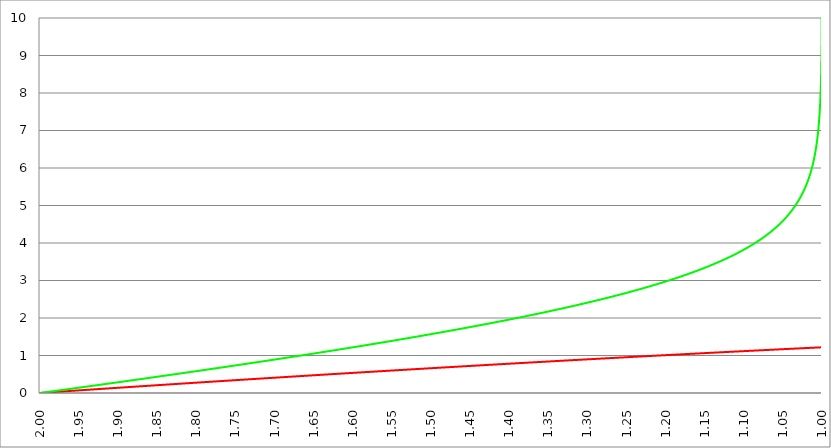
| Category | Series 1 | Series 0 | Series 2 |
|---|---|---|---|
| 2.0 | 0 | 0 |  |
| 1.9995 | 0.001 | 0.001 |  |
| 1.999 | 0.001 | 0.003 |  |
| 1.9985 | 0.002 | 0.004 |  |
| 1.998 | 0.003 | 0.006 |  |
| 1.9975 | 0.004 | 0.007 |  |
| 1.997 | 0.004 | 0.008 |  |
| 1.9965 | 0.005 | 0.01 |  |
| 1.996 | 0.006 | 0.011 |  |
| 1.9955 | 0.006 | 0.013 |  |
| 1.995000000000001 | 0.007 | 0.014 |  |
| 1.994500000000001 | 0.008 | 0.016 |  |
| 1.994000000000001 | 0.008 | 0.017 |  |
| 1.993500000000001 | 0.009 | 0.018 |  |
| 1.993000000000001 | 0.01 | 0.02 |  |
| 1.992500000000001 | 0.011 | 0.021 |  |
| 1.992000000000001 | 0.011 | 0.023 |  |
| 1.991500000000001 | 0.012 | 0.024 |  |
| 1.991000000000001 | 0.013 | 0.025 |  |
| 1.990500000000001 | 0.013 | 0.027 |  |
| 1.990000000000001 | 0.014 | 0.028 |  |
| 1.989500000000001 | 0.015 | 0.03 |  |
| 1.989000000000001 | 0.016 | 0.031 |  |
| 1.988500000000001 | 0.016 | 0.033 |  |
| 1.988000000000001 | 0.017 | 0.034 |  |
| 1.987500000000001 | 0.018 | 0.035 |  |
| 1.987000000000001 | 0.018 | 0.037 |  |
| 1.986500000000001 | 0.019 | 0.038 |  |
| 1.986000000000002 | 0.02 | 0.04 |  |
| 1.985500000000002 | 0.02 | 0.041 |  |
| 1.985000000000002 | 0.021 | 0.043 |  |
| 1.984500000000002 | 0.022 | 0.044 |  |
| 1.984000000000002 | 0.023 | 0.045 |  |
| 1.983500000000002 | 0.023 | 0.047 |  |
| 1.983000000000002 | 0.024 | 0.048 |  |
| 1.982500000000002 | 0.025 | 0.05 |  |
| 1.982000000000002 | 0.025 | 0.051 |  |
| 1.981500000000002 | 0.026 | 0.052 |  |
| 1.981000000000002 | 0.027 | 0.054 |  |
| 1.980500000000002 | 0.028 | 0.055 |  |
| 1.980000000000002 | 0.028 | 0.057 |  |
| 1.979500000000002 | 0.029 | 0.058 |  |
| 1.979000000000002 | 0.03 | 0.06 |  |
| 1.978500000000002 | 0.03 | 0.061 |  |
| 1.978000000000002 | 0.031 | 0.062 |  |
| 1.977500000000002 | 0.032 | 0.064 |  |
| 1.977000000000003 | 0.032 | 0.065 |  |
| 1.976500000000003 | 0.033 | 0.067 |  |
| 1.976000000000003 | 0.034 | 0.068 |  |
| 1.975500000000003 | 0.035 | 0.07 |  |
| 1.975000000000003 | 0.035 | 0.071 |  |
| 1.974500000000003 | 0.036 | 0.072 |  |
| 1.974000000000003 | 0.037 | 0.074 |  |
| 1.973500000000003 | 0.037 | 0.075 |  |
| 1.973000000000003 | 0.038 | 0.077 |  |
| 1.972500000000003 | 0.039 | 0.078 |  |
| 1.972000000000003 | 0.039 | 0.079 |  |
| 1.971500000000003 | 0.04 | 0.081 |  |
| 1.971000000000003 | 0.041 | 0.082 |  |
| 1.970500000000003 | 0.042 | 0.084 |  |
| 1.970000000000003 | 0.042 | 0.085 |  |
| 1.969500000000003 | 0.043 | 0.087 |  |
| 1.969000000000003 | 0.044 | 0.088 |  |
| 1.968500000000003 | 0.044 | 0.089 |  |
| 1.968000000000003 | 0.045 | 0.091 |  |
| 1.967500000000004 | 0.046 | 0.092 |  |
| 1.967000000000004 | 0.046 | 0.094 |  |
| 1.966500000000004 | 0.047 | 0.095 |  |
| 1.966000000000004 | 0.048 | 0.097 |  |
| 1.965500000000004 | 0.049 | 0.098 |  |
| 1.965000000000004 | 0.049 | 0.099 |  |
| 1.964500000000004 | 0.05 | 0.101 |  |
| 1.964000000000004 | 0.051 | 0.102 |  |
| 1.963500000000004 | 0.051 | 0.104 |  |
| 1.963000000000004 | 0.052 | 0.105 |  |
| 1.962500000000004 | 0.053 | 0.107 |  |
| 1.962000000000004 | 0.053 | 0.108 |  |
| 1.961500000000004 | 0.054 | 0.109 |  |
| 1.961000000000004 | 0.055 | 0.111 |  |
| 1.960500000000004 | 0.056 | 0.112 |  |
| 1.960000000000004 | 0.056 | 0.114 |  |
| 1.959500000000004 | 0.057 | 0.115 |  |
| 1.959000000000004 | 0.058 | 0.117 |  |
| 1.958500000000005 | 0.058 | 0.118 |  |
| 1.958000000000005 | 0.059 | 0.119 |  |
| 1.957500000000005 | 0.06 | 0.121 |  |
| 1.957000000000005 | 0.06 | 0.122 |  |
| 1.956500000000005 | 0.061 | 0.124 |  |
| 1.956000000000005 | 0.062 | 0.125 |  |
| 1.955500000000005 | 0.063 | 0.127 |  |
| 1.955000000000005 | 0.063 | 0.128 |  |
| 1.954500000000005 | 0.064 | 0.129 |  |
| 1.954000000000005 | 0.065 | 0.131 |  |
| 1.953500000000005 | 0.065 | 0.132 |  |
| 1.953000000000005 | 0.066 | 0.134 |  |
| 1.952500000000005 | 0.067 | 0.135 |  |
| 1.952000000000005 | 0.067 | 0.137 |  |
| 1.951500000000005 | 0.068 | 0.138 |  |
| 1.951000000000005 | 0.069 | 0.139 |  |
| 1.950500000000005 | 0.07 | 0.141 |  |
| 1.950000000000005 | 0.07 | 0.142 |  |
| 1.949500000000006 | 0.071 | 0.144 |  |
| 1.949000000000006 | 0.072 | 0.145 |  |
| 1.948500000000006 | 0.072 | 0.147 |  |
| 1.948000000000006 | 0.073 | 0.148 |  |
| 1.947500000000006 | 0.074 | 0.15 |  |
| 1.947000000000006 | 0.074 | 0.151 |  |
| 1.946500000000006 | 0.075 | 0.152 |  |
| 1.946000000000006 | 0.076 | 0.154 |  |
| 1.945500000000006 | 0.077 | 0.155 |  |
| 1.945000000000006 | 0.077 | 0.157 |  |
| 1.944500000000006 | 0.078 | 0.158 |  |
| 1.944000000000006 | 0.079 | 0.16 |  |
| 1.943500000000006 | 0.079 | 0.161 |  |
| 1.943000000000006 | 0.08 | 0.162 |  |
| 1.942500000000006 | 0.081 | 0.164 |  |
| 1.942000000000006 | 0.081 | 0.165 |  |
| 1.941500000000006 | 0.082 | 0.167 |  |
| 1.941000000000006 | 0.083 | 0.168 |  |
| 1.940500000000007 | 0.084 | 0.17 |  |
| 1.940000000000007 | 0.084 | 0.171 |  |
| 1.939500000000007 | 0.085 | 0.172 |  |
| 1.939000000000007 | 0.086 | 0.174 |  |
| 1.938500000000007 | 0.086 | 0.175 |  |
| 1.938000000000007 | 0.087 | 0.177 |  |
| 1.937500000000007 | 0.088 | 0.178 |  |
| 1.937000000000007 | 0.088 | 0.18 |  |
| 1.936500000000007 | 0.089 | 0.181 |  |
| 1.936000000000007 | 0.09 | 0.183 |  |
| 1.935500000000007 | 0.09 | 0.184 |  |
| 1.935000000000007 | 0.091 | 0.185 |  |
| 1.934500000000007 | 0.092 | 0.187 |  |
| 1.934000000000007 | 0.093 | 0.188 |  |
| 1.933500000000007 | 0.093 | 0.19 |  |
| 1.933000000000007 | 0.094 | 0.191 |  |
| 1.932500000000007 | 0.095 | 0.193 |  |
| 1.932000000000007 | 0.095 | 0.194 |  |
| 1.931500000000008 | 0.096 | 0.196 |  |
| 1.931000000000008 | 0.097 | 0.197 |  |
| 1.930500000000008 | 0.097 | 0.198 |  |
| 1.930000000000008 | 0.098 | 0.2 |  |
| 1.929500000000008 | 0.099 | 0.201 |  |
| 1.929000000000008 | 0.1 | 0.203 |  |
| 1.928500000000008 | 0.1 | 0.204 |  |
| 1.928000000000008 | 0.101 | 0.206 |  |
| 1.927500000000008 | 0.102 | 0.207 |  |
| 1.927000000000008 | 0.102 | 0.208 |  |
| 1.926500000000008 | 0.103 | 0.21 |  |
| 1.926000000000008 | 0.104 | 0.211 |  |
| 1.925500000000008 | 0.104 | 0.213 |  |
| 1.925000000000008 | 0.105 | 0.214 |  |
| 1.924500000000008 | 0.106 | 0.216 |  |
| 1.924000000000008 | 0.106 | 0.217 |  |
| 1.923500000000008 | 0.107 | 0.219 |  |
| 1.923000000000008 | 0.108 | 0.22 |  |
| 1.922500000000009 | 0.109 | 0.221 |  |
| 1.922000000000009 | 0.109 | 0.223 |  |
| 1.921500000000009 | 0.11 | 0.224 |  |
| 1.921000000000009 | 0.111 | 0.226 |  |
| 1.920500000000009 | 0.111 | 0.227 |  |
| 1.920000000000009 | 0.112 | 0.229 |  |
| 1.919500000000009 | 0.113 | 0.23 |  |
| 1.919000000000009 | 0.113 | 0.232 |  |
| 1.918500000000009 | 0.114 | 0.233 |  |
| 1.91800000000001 | 0.115 | 0.234 |  |
| 1.917500000000009 | 0.115 | 0.236 |  |
| 1.917000000000009 | 0.116 | 0.237 |  |
| 1.916500000000009 | 0.117 | 0.239 |  |
| 1.916000000000009 | 0.118 | 0.24 |  |
| 1.915500000000009 | 0.118 | 0.242 |  |
| 1.915000000000009 | 0.119 | 0.243 |  |
| 1.914500000000009 | 0.12 | 0.245 |  |
| 1.914000000000009 | 0.12 | 0.246 |  |
| 1.91350000000001 | 0.121 | 0.248 |  |
| 1.91300000000001 | 0.122 | 0.249 |  |
| 1.91250000000001 | 0.122 | 0.25 |  |
| 1.91200000000001 | 0.123 | 0.252 |  |
| 1.91150000000001 | 0.124 | 0.253 |  |
| 1.91100000000001 | 0.124 | 0.255 |  |
| 1.91050000000001 | 0.125 | 0.256 |  |
| 1.91000000000001 | 0.126 | 0.258 |  |
| 1.90950000000001 | 0.127 | 0.259 |  |
| 1.90900000000001 | 0.127 | 0.261 |  |
| 1.90850000000001 | 0.128 | 0.262 |  |
| 1.90800000000001 | 0.129 | 0.263 |  |
| 1.90750000000001 | 0.129 | 0.265 |  |
| 1.90700000000001 | 0.13 | 0.266 |  |
| 1.90650000000001 | 0.131 | 0.268 |  |
| 1.90600000000001 | 0.131 | 0.269 |  |
| 1.90550000000001 | 0.132 | 0.271 |  |
| 1.90500000000001 | 0.133 | 0.272 |  |
| 1.90450000000001 | 0.133 | 0.274 |  |
| 1.904000000000011 | 0.134 | 0.275 |  |
| 1.903500000000011 | 0.135 | 0.277 |  |
| 1.903000000000011 | 0.136 | 0.278 |  |
| 1.902500000000011 | 0.136 | 0.279 |  |
| 1.902000000000011 | 0.137 | 0.281 |  |
| 1.901500000000011 | 0.138 | 0.282 |  |
| 1.901000000000011 | 0.138 | 0.284 |  |
| 1.900500000000011 | 0.139 | 0.285 |  |
| 1.900000000000011 | 0.14 | 0.287 |  |
| 1.899500000000011 | 0.14 | 0.288 |  |
| 1.899000000000011 | 0.141 | 0.29 |  |
| 1.898500000000011 | 0.142 | 0.291 |  |
| 1.898000000000011 | 0.142 | 0.293 |  |
| 1.897500000000011 | 0.143 | 0.294 |  |
| 1.897000000000011 | 0.144 | 0.295 |  |
| 1.896500000000011 | 0.144 | 0.297 |  |
| 1.896000000000011 | 0.145 | 0.298 |  |
| 1.895500000000011 | 0.146 | 0.3 |  |
| 1.895000000000011 | 0.147 | 0.301 |  |
| 1.894500000000012 | 0.147 | 0.303 |  |
| 1.894000000000012 | 0.148 | 0.304 |  |
| 1.893500000000012 | 0.149 | 0.306 |  |
| 1.893000000000012 | 0.149 | 0.307 |  |
| 1.892500000000012 | 0.15 | 0.309 |  |
| 1.892000000000012 | 0.151 | 0.31 |  |
| 1.891500000000012 | 0.151 | 0.311 |  |
| 1.891000000000012 | 0.152 | 0.313 |  |
| 1.890500000000012 | 0.153 | 0.314 |  |
| 1.890000000000012 | 0.153 | 0.316 |  |
| 1.889500000000012 | 0.154 | 0.317 |  |
| 1.889000000000012 | 0.155 | 0.319 |  |
| 1.888500000000012 | 0.155 | 0.32 |  |
| 1.888000000000012 | 0.156 | 0.322 |  |
| 1.887500000000012 | 0.157 | 0.323 |  |
| 1.887000000000012 | 0.158 | 0.325 |  |
| 1.886500000000012 | 0.158 | 0.326 |  |
| 1.886000000000012 | 0.159 | 0.328 |  |
| 1.885500000000013 | 0.16 | 0.329 |  |
| 1.885000000000013 | 0.16 | 0.33 |  |
| 1.884500000000013 | 0.161 | 0.332 |  |
| 1.884000000000013 | 0.162 | 0.333 |  |
| 1.883500000000013 | 0.162 | 0.335 |  |
| 1.883000000000013 | 0.163 | 0.336 |  |
| 1.882500000000013 | 0.164 | 0.338 |  |
| 1.882000000000013 | 0.164 | 0.339 |  |
| 1.881500000000013 | 0.165 | 0.341 |  |
| 1.881000000000013 | 0.166 | 0.342 |  |
| 1.880500000000013 | 0.166 | 0.344 |  |
| 1.880000000000013 | 0.167 | 0.345 |  |
| 1.879500000000013 | 0.168 | 0.347 |  |
| 1.879000000000013 | 0.169 | 0.348 |  |
| 1.878500000000013 | 0.169 | 0.35 |  |
| 1.878000000000013 | 0.17 | 0.351 |  |
| 1.877500000000013 | 0.171 | 0.352 |  |
| 1.877000000000013 | 0.171 | 0.354 |  |
| 1.876500000000014 | 0.172 | 0.355 |  |
| 1.876000000000014 | 0.173 | 0.357 |  |
| 1.875500000000014 | 0.173 | 0.358 |  |
| 1.875000000000014 | 0.174 | 0.36 |  |
| 1.874500000000014 | 0.175 | 0.361 |  |
| 1.874000000000014 | 0.175 | 0.363 |  |
| 1.873500000000014 | 0.176 | 0.364 |  |
| 1.873000000000014 | 0.177 | 0.366 |  |
| 1.872500000000014 | 0.177 | 0.367 |  |
| 1.872000000000014 | 0.178 | 0.369 |  |
| 1.871500000000014 | 0.179 | 0.37 |  |
| 1.871000000000014 | 0.179 | 0.372 |  |
| 1.870500000000014 | 0.18 | 0.373 |  |
| 1.870000000000014 | 0.181 | 0.374 |  |
| 1.869500000000014 | 0.182 | 0.376 |  |
| 1.869000000000014 | 0.182 | 0.377 |  |
| 1.868500000000014 | 0.183 | 0.379 |  |
| 1.868000000000014 | 0.184 | 0.38 |  |
| 1.867500000000015 | 0.184 | 0.382 |  |
| 1.867000000000015 | 0.185 | 0.383 |  |
| 1.866500000000015 | 0.186 | 0.385 |  |
| 1.866000000000015 | 0.186 | 0.386 |  |
| 1.865500000000015 | 0.187 | 0.388 |  |
| 1.865000000000015 | 0.188 | 0.389 |  |
| 1.864500000000015 | 0.188 | 0.391 |  |
| 1.864000000000015 | 0.189 | 0.392 |  |
| 1.863500000000015 | 0.19 | 0.394 |  |
| 1.863000000000015 | 0.19 | 0.395 |  |
| 1.862500000000015 | 0.191 | 0.397 |  |
| 1.862000000000015 | 0.192 | 0.398 |  |
| 1.861500000000015 | 0.192 | 0.399 |  |
| 1.861000000000015 | 0.193 | 0.401 |  |
| 1.860500000000015 | 0.194 | 0.402 |  |
| 1.860000000000015 | 0.194 | 0.404 |  |
| 1.859500000000015 | 0.195 | 0.405 |  |
| 1.859000000000015 | 0.196 | 0.407 |  |
| 1.858500000000016 | 0.197 | 0.408 |  |
| 1.858000000000016 | 0.197 | 0.41 |  |
| 1.857500000000016 | 0.198 | 0.411 |  |
| 1.857000000000016 | 0.199 | 0.413 |  |
| 1.856500000000016 | 0.199 | 0.414 |  |
| 1.856000000000016 | 0.2 | 0.416 |  |
| 1.855500000000016 | 0.201 | 0.417 |  |
| 1.855000000000016 | 0.201 | 0.419 |  |
| 1.854500000000016 | 0.202 | 0.42 |  |
| 1.854000000000016 | 0.203 | 0.422 |  |
| 1.853500000000016 | 0.203 | 0.423 |  |
| 1.853000000000016 | 0.204 | 0.425 |  |
| 1.852500000000016 | 0.205 | 0.426 |  |
| 1.852000000000016 | 0.205 | 0.428 |  |
| 1.851500000000016 | 0.206 | 0.429 |  |
| 1.851000000000016 | 0.207 | 0.43 |  |
| 1.850500000000016 | 0.207 | 0.432 |  |
| 1.850000000000016 | 0.208 | 0.433 |  |
| 1.849500000000017 | 0.209 | 0.435 |  |
| 1.849000000000017 | 0.209 | 0.436 |  |
| 1.848500000000017 | 0.21 | 0.438 |  |
| 1.848000000000017 | 0.211 | 0.439 |  |
| 1.847500000000017 | 0.212 | 0.441 |  |
| 1.847000000000017 | 0.212 | 0.442 |  |
| 1.846500000000017 | 0.213 | 0.444 |  |
| 1.846000000000017 | 0.214 | 0.445 |  |
| 1.845500000000017 | 0.214 | 0.447 |  |
| 1.845000000000017 | 0.215 | 0.448 |  |
| 1.844500000000017 | 0.216 | 0.45 |  |
| 1.844000000000017 | 0.216 | 0.451 |  |
| 1.843500000000017 | 0.217 | 0.453 |  |
| 1.843000000000017 | 0.218 | 0.454 |  |
| 1.842500000000017 | 0.218 | 0.456 |  |
| 1.842000000000017 | 0.219 | 0.457 |  |
| 1.841500000000017 | 0.22 | 0.459 |  |
| 1.841000000000017 | 0.22 | 0.46 |  |
| 1.840500000000018 | 0.221 | 0.462 |  |
| 1.840000000000018 | 0.222 | 0.463 |  |
| 1.839500000000018 | 0.222 | 0.465 |  |
| 1.839000000000018 | 0.223 | 0.466 |  |
| 1.838500000000018 | 0.224 | 0.468 |  |
| 1.838000000000018 | 0.224 | 0.469 |  |
| 1.837500000000018 | 0.225 | 0.471 |  |
| 1.837000000000018 | 0.226 | 0.472 |  |
| 1.836500000000018 | 0.226 | 0.474 |  |
| 1.836000000000018 | 0.227 | 0.475 |  |
| 1.835500000000018 | 0.228 | 0.476 |  |
| 1.835000000000018 | 0.228 | 0.478 |  |
| 1.834500000000018 | 0.229 | 0.479 |  |
| 1.834000000000018 | 0.23 | 0.481 |  |
| 1.833500000000018 | 0.23 | 0.482 |  |
| 1.833000000000018 | 0.231 | 0.484 |  |
| 1.832500000000018 | 0.232 | 0.485 |  |
| 1.832000000000018 | 0.233 | 0.487 |  |
| 1.831500000000019 | 0.233 | 0.488 |  |
| 1.831000000000019 | 0.234 | 0.49 |  |
| 1.830500000000019 | 0.235 | 0.491 |  |
| 1.830000000000019 | 0.235 | 0.493 |  |
| 1.829500000000019 | 0.236 | 0.494 |  |
| 1.829000000000019 | 0.237 | 0.496 |  |
| 1.828500000000019 | 0.237 | 0.497 |  |
| 1.828000000000019 | 0.238 | 0.499 |  |
| 1.827500000000019 | 0.239 | 0.5 |  |
| 1.82700000000002 | 0.239 | 0.502 |  |
| 1.82650000000002 | 0.24 | 0.503 |  |
| 1.82600000000002 | 0.241 | 0.505 |  |
| 1.825500000000019 | 0.241 | 0.506 |  |
| 1.825000000000019 | 0.242 | 0.508 |  |
| 1.824500000000019 | 0.243 | 0.509 |  |
| 1.824000000000019 | 0.243 | 0.511 |  |
| 1.823500000000019 | 0.244 | 0.512 |  |
| 1.823000000000019 | 0.245 | 0.514 |  |
| 1.822500000000019 | 0.245 | 0.515 |  |
| 1.82200000000002 | 0.246 | 0.517 |  |
| 1.82150000000002 | 0.247 | 0.518 |  |
| 1.82100000000002 | 0.247 | 0.52 |  |
| 1.82050000000002 | 0.248 | 0.521 |  |
| 1.82000000000002 | 0.249 | 0.523 |  |
| 1.81950000000002 | 0.249 | 0.524 |  |
| 1.81900000000002 | 0.25 | 0.526 |  |
| 1.81850000000002 | 0.251 | 0.527 |  |
| 1.81800000000002 | 0.251 | 0.529 |  |
| 1.81750000000002 | 0.252 | 0.53 |  |
| 1.81700000000002 | 0.253 | 0.532 |  |
| 1.81650000000002 | 0.253 | 0.533 |  |
| 1.81600000000002 | 0.254 | 0.535 |  |
| 1.81550000000002 | 0.255 | 0.536 |  |
| 1.81500000000002 | 0.255 | 0.538 |  |
| 1.81450000000002 | 0.256 | 0.539 |  |
| 1.81400000000002 | 0.257 | 0.541 |  |
| 1.81350000000002 | 0.258 | 0.542 |  |
| 1.813000000000021 | 0.258 | 0.544 |  |
| 1.812500000000021 | 0.259 | 0.545 |  |
| 1.812000000000021 | 0.26 | 0.547 |  |
| 1.811500000000021 | 0.26 | 0.548 |  |
| 1.811000000000021 | 0.261 | 0.55 |  |
| 1.810500000000021 | 0.262 | 0.551 |  |
| 1.810000000000021 | 0.262 | 0.553 |  |
| 1.809500000000021 | 0.263 | 0.554 |  |
| 1.809000000000021 | 0.264 | 0.556 |  |
| 1.808500000000021 | 0.264 | 0.557 |  |
| 1.808000000000021 | 0.265 | 0.559 |  |
| 1.807500000000021 | 0.266 | 0.56 |  |
| 1.807000000000021 | 0.266 | 0.562 |  |
| 1.806500000000021 | 0.267 | 0.563 |  |
| 1.806000000000021 | 0.268 | 0.565 |  |
| 1.805500000000021 | 0.268 | 0.566 |  |
| 1.805000000000021 | 0.269 | 0.568 |  |
| 1.804500000000021 | 0.27 | 0.569 |  |
| 1.804000000000022 | 0.27 | 0.571 |  |
| 1.803500000000022 | 0.271 | 0.572 |  |
| 1.803000000000022 | 0.272 | 0.574 |  |
| 1.802500000000022 | 0.272 | 0.575 |  |
| 1.802000000000022 | 0.273 | 0.577 |  |
| 1.801500000000022 | 0.274 | 0.578 |  |
| 1.801000000000022 | 0.274 | 0.58 |  |
| 1.800500000000022 | 0.275 | 0.581 |  |
| 1.800000000000022 | 0.276 | 0.583 |  |
| 1.799500000000022 | 0.276 | 0.584 |  |
| 1.799000000000022 | 0.277 | 0.586 |  |
| 1.798500000000022 | 0.278 | 0.587 |  |
| 1.798000000000022 | 0.278 | 0.589 |  |
| 1.797500000000022 | 0.279 | 0.59 |  |
| 1.797000000000022 | 0.28 | 0.592 |  |
| 1.796500000000022 | 0.28 | 0.593 |  |
| 1.796000000000022 | 0.281 | 0.595 |  |
| 1.795500000000022 | 0.282 | 0.596 |  |
| 1.795000000000022 | 0.282 | 0.598 |  |
| 1.794500000000023 | 0.283 | 0.6 |  |
| 1.794000000000023 | 0.284 | 0.601 |  |
| 1.793500000000023 | 0.284 | 0.603 |  |
| 1.793000000000023 | 0.285 | 0.604 |  |
| 1.792500000000023 | 0.286 | 0.606 |  |
| 1.792000000000023 | 0.286 | 0.607 |  |
| 1.791500000000023 | 0.287 | 0.609 |  |
| 1.791000000000023 | 0.288 | 0.61 |  |
| 1.790500000000023 | 0.288 | 0.612 |  |
| 1.790000000000023 | 0.289 | 0.613 |  |
| 1.789500000000023 | 0.29 | 0.615 |  |
| 1.789000000000023 | 0.29 | 0.616 |  |
| 1.788500000000023 | 0.291 | 0.618 |  |
| 1.788000000000023 | 0.292 | 0.619 |  |
| 1.787500000000023 | 0.292 | 0.621 |  |
| 1.787000000000023 | 0.293 | 0.622 |  |
| 1.786500000000023 | 0.294 | 0.624 |  |
| 1.786000000000023 | 0.294 | 0.625 |  |
| 1.785500000000024 | 0.295 | 0.627 |  |
| 1.785000000000024 | 0.296 | 0.628 |  |
| 1.784500000000024 | 0.296 | 0.63 |  |
| 1.784000000000024 | 0.297 | 0.631 |  |
| 1.783500000000024 | 0.298 | 0.633 |  |
| 1.783000000000024 | 0.298 | 0.634 |  |
| 1.782500000000024 | 0.299 | 0.636 |  |
| 1.782000000000024 | 0.3 | 0.637 |  |
| 1.781500000000024 | 0.3 | 0.639 |  |
| 1.781000000000024 | 0.301 | 0.64 |  |
| 1.780500000000024 | 0.302 | 0.642 |  |
| 1.780000000000024 | 0.302 | 0.644 |  |
| 1.779500000000024 | 0.303 | 0.645 |  |
| 1.779000000000024 | 0.304 | 0.647 |  |
| 1.778500000000024 | 0.304 | 0.648 |  |
| 1.778000000000024 | 0.305 | 0.65 |  |
| 1.777500000000024 | 0.306 | 0.651 |  |
| 1.777000000000024 | 0.306 | 0.653 |  |
| 1.776500000000025 | 0.307 | 0.654 |  |
| 1.776000000000025 | 0.308 | 0.656 |  |
| 1.775500000000025 | 0.308 | 0.657 |  |
| 1.775000000000025 | 0.309 | 0.659 |  |
| 1.774500000000025 | 0.31 | 0.66 |  |
| 1.774000000000025 | 0.31 | 0.662 |  |
| 1.773500000000025 | 0.311 | 0.663 |  |
| 1.773000000000025 | 0.312 | 0.665 |  |
| 1.772500000000025 | 0.312 | 0.666 |  |
| 1.772000000000025 | 0.313 | 0.668 |  |
| 1.771500000000025 | 0.314 | 0.669 |  |
| 1.771000000000025 | 0.314 | 0.671 |  |
| 1.770500000000025 | 0.315 | 0.673 |  |
| 1.770000000000025 | 0.316 | 0.674 |  |
| 1.769500000000025 | 0.316 | 0.676 |  |
| 1.769000000000025 | 0.317 | 0.677 |  |
| 1.768500000000025 | 0.318 | 0.679 |  |
| 1.768000000000025 | 0.318 | 0.68 |  |
| 1.767500000000026 | 0.319 | 0.682 |  |
| 1.767000000000026 | 0.32 | 0.683 |  |
| 1.766500000000026 | 0.32 | 0.685 |  |
| 1.766000000000026 | 0.321 | 0.686 |  |
| 1.765500000000026 | 0.322 | 0.688 |  |
| 1.765000000000026 | 0.322 | 0.689 |  |
| 1.764500000000026 | 0.323 | 0.691 |  |
| 1.764000000000026 | 0.324 | 0.692 |  |
| 1.763500000000026 | 0.324 | 0.694 |  |
| 1.763000000000026 | 0.325 | 0.695 |  |
| 1.762500000000026 | 0.326 | 0.697 |  |
| 1.762000000000026 | 0.326 | 0.699 |  |
| 1.761500000000026 | 0.327 | 0.7 |  |
| 1.761000000000026 | 0.328 | 0.702 |  |
| 1.760500000000026 | 0.328 | 0.703 |  |
| 1.760000000000026 | 0.329 | 0.705 |  |
| 1.759500000000026 | 0.33 | 0.706 |  |
| 1.759000000000026 | 0.33 | 0.708 |  |
| 1.758500000000027 | 0.331 | 0.709 |  |
| 1.758000000000027 | 0.332 | 0.711 |  |
| 1.757500000000027 | 0.332 | 0.712 |  |
| 1.757000000000027 | 0.333 | 0.714 |  |
| 1.756500000000027 | 0.334 | 0.715 |  |
| 1.756000000000027 | 0.334 | 0.717 |  |
| 1.755500000000027 | 0.335 | 0.719 |  |
| 1.755000000000027 | 0.336 | 0.72 |  |
| 1.754500000000027 | 0.336 | 0.722 |  |
| 1.754000000000027 | 0.337 | 0.723 |  |
| 1.753500000000027 | 0.338 | 0.725 |  |
| 1.753000000000027 | 0.338 | 0.726 |  |
| 1.752500000000027 | 0.339 | 0.728 |  |
| 1.752000000000027 | 0.34 | 0.729 |  |
| 1.751500000000027 | 0.34 | 0.731 |  |
| 1.751000000000027 | 0.341 | 0.732 |  |
| 1.750500000000027 | 0.342 | 0.734 |  |
| 1.750000000000027 | 0.342 | 0.735 |  |
| 1.749500000000028 | 0.343 | 0.737 |  |
| 1.749000000000028 | 0.344 | 0.739 |  |
| 1.748500000000028 | 0.344 | 0.74 |  |
| 1.748000000000028 | 0.345 | 0.742 |  |
| 1.747500000000028 | 0.346 | 0.743 |  |
| 1.747000000000028 | 0.346 | 0.745 |  |
| 1.746500000000028 | 0.347 | 0.746 |  |
| 1.746000000000028 | 0.348 | 0.748 |  |
| 1.745500000000028 | 0.348 | 0.749 |  |
| 1.745000000000028 | 0.349 | 0.751 |  |
| 1.744500000000028 | 0.35 | 0.752 |  |
| 1.744000000000028 | 0.35 | 0.754 |  |
| 1.743500000000028 | 0.351 | 0.756 |  |
| 1.743000000000028 | 0.352 | 0.757 |  |
| 1.742500000000028 | 0.352 | 0.759 |  |
| 1.742000000000028 | 0.353 | 0.76 |  |
| 1.741500000000028 | 0.353 | 0.762 |  |
| 1.741000000000028 | 0.354 | 0.763 |  |
| 1.740500000000029 | 0.355 | 0.765 |  |
| 1.740000000000029 | 0.355 | 0.766 |  |
| 1.739500000000029 | 0.356 | 0.768 |  |
| 1.739000000000029 | 0.357 | 0.77 |  |
| 1.738500000000029 | 0.357 | 0.771 |  |
| 1.738000000000029 | 0.358 | 0.773 |  |
| 1.737500000000029 | 0.359 | 0.774 |  |
| 1.737000000000029 | 0.359 | 0.776 |  |
| 1.736500000000029 | 0.36 | 0.777 |  |
| 1.73600000000003 | 0.361 | 0.779 |  |
| 1.73550000000003 | 0.361 | 0.78 |  |
| 1.73500000000003 | 0.362 | 0.782 |  |
| 1.73450000000003 | 0.363 | 0.784 |  |
| 1.73400000000003 | 0.363 | 0.785 |  |
| 1.733500000000029 | 0.364 | 0.787 |  |
| 1.733000000000029 | 0.365 | 0.788 |  |
| 1.732500000000029 | 0.365 | 0.79 |  |
| 1.732000000000029 | 0.366 | 0.791 |  |
| 1.731500000000029 | 0.367 | 0.793 |  |
| 1.73100000000003 | 0.367 | 0.794 |  |
| 1.73050000000003 | 0.368 | 0.796 |  |
| 1.73000000000003 | 0.369 | 0.798 |  |
| 1.72950000000003 | 0.369 | 0.799 |  |
| 1.72900000000003 | 0.37 | 0.801 |  |
| 1.72850000000003 | 0.371 | 0.802 |  |
| 1.72800000000003 | 0.371 | 0.804 |  |
| 1.72750000000003 | 0.372 | 0.805 |  |
| 1.72700000000003 | 0.373 | 0.807 |  |
| 1.72650000000003 | 0.373 | 0.808 |  |
| 1.72600000000003 | 0.374 | 0.81 |  |
| 1.72550000000003 | 0.375 | 0.812 |  |
| 1.72500000000003 | 0.375 | 0.813 |  |
| 1.72450000000003 | 0.376 | 0.815 |  |
| 1.72400000000003 | 0.377 | 0.816 |  |
| 1.72350000000003 | 0.377 | 0.818 |  |
| 1.72300000000003 | 0.378 | 0.819 |  |
| 1.72250000000003 | 0.378 | 0.821 |  |
| 1.722000000000031 | 0.379 | 0.823 |  |
| 1.721500000000031 | 0.38 | 0.824 |  |
| 1.721000000000031 | 0.38 | 0.826 |  |
| 1.720500000000031 | 0.381 | 0.827 |  |
| 1.720000000000031 | 0.382 | 0.829 |  |
| 1.719500000000031 | 0.382 | 0.83 |  |
| 1.719000000000031 | 0.383 | 0.832 |  |
| 1.718500000000031 | 0.384 | 0.833 |  |
| 1.718000000000031 | 0.384 | 0.835 |  |
| 1.717500000000031 | 0.385 | 0.837 |  |
| 1.717000000000031 | 0.386 | 0.838 |  |
| 1.716500000000031 | 0.386 | 0.84 |  |
| 1.716000000000031 | 0.387 | 0.841 |  |
| 1.715500000000031 | 0.388 | 0.843 |  |
| 1.715000000000031 | 0.388 | 0.844 |  |
| 1.714500000000031 | 0.389 | 0.846 |  |
| 1.714000000000031 | 0.39 | 0.848 |  |
| 1.713500000000031 | 0.39 | 0.849 |  |
| 1.713000000000032 | 0.391 | 0.851 |  |
| 1.712500000000032 | 0.392 | 0.852 |  |
| 1.712000000000032 | 0.392 | 0.854 |  |
| 1.711500000000032 | 0.393 | 0.855 |  |
| 1.711000000000032 | 0.394 | 0.857 |  |
| 1.710500000000032 | 0.394 | 0.859 |  |
| 1.710000000000032 | 0.395 | 0.86 |  |
| 1.709500000000032 | 0.396 | 0.862 |  |
| 1.709000000000032 | 0.396 | 0.863 |  |
| 1.708500000000032 | 0.397 | 0.865 |  |
| 1.708000000000032 | 0.397 | 0.866 |  |
| 1.707500000000032 | 0.398 | 0.868 |  |
| 1.707000000000032 | 0.399 | 0.87 |  |
| 1.706500000000032 | 0.399 | 0.871 |  |
| 1.706000000000032 | 0.4 | 0.873 |  |
| 1.705500000000032 | 0.401 | 0.874 |  |
| 1.705000000000032 | 0.401 | 0.876 |  |
| 1.704500000000032 | 0.402 | 0.878 |  |
| 1.704000000000033 | 0.403 | 0.879 |  |
| 1.703500000000033 | 0.403 | 0.881 |  |
| 1.703000000000033 | 0.404 | 0.882 |  |
| 1.702500000000033 | 0.405 | 0.884 |  |
| 1.702000000000033 | 0.405 | 0.885 |  |
| 1.701500000000033 | 0.406 | 0.887 |  |
| 1.701000000000033 | 0.407 | 0.889 |  |
| 1.700500000000033 | 0.407 | 0.89 |  |
| 1.700000000000033 | 0.408 | 0.892 |  |
| 1.699500000000033 | 0.409 | 0.893 |  |
| 1.699000000000033 | 0.409 | 0.895 |  |
| 1.698500000000033 | 0.41 | 0.897 |  |
| 1.698000000000033 | 0.411 | 0.898 |  |
| 1.697500000000033 | 0.411 | 0.9 |  |
| 1.697000000000033 | 0.412 | 0.901 |  |
| 1.696500000000033 | 0.412 | 0.903 |  |
| 1.696000000000033 | 0.413 | 0.904 |  |
| 1.695500000000033 | 0.414 | 0.906 |  |
| 1.695000000000033 | 0.414 | 0.908 |  |
| 1.694500000000034 | 0.415 | 0.909 |  |
| 1.694000000000034 | 0.416 | 0.911 |  |
| 1.693500000000034 | 0.416 | 0.912 |  |
| 1.693000000000034 | 0.417 | 0.914 |  |
| 1.692500000000034 | 0.418 | 0.916 |  |
| 1.692000000000034 | 0.418 | 0.917 |  |
| 1.691500000000034 | 0.419 | 0.919 |  |
| 1.691000000000034 | 0.42 | 0.92 |  |
| 1.690500000000034 | 0.42 | 0.922 |  |
| 1.690000000000034 | 0.421 | 0.924 |  |
| 1.689500000000034 | 0.422 | 0.925 |  |
| 1.689000000000034 | 0.422 | 0.927 |  |
| 1.688500000000034 | 0.423 | 0.928 |  |
| 1.688000000000034 | 0.424 | 0.93 |  |
| 1.687500000000034 | 0.424 | 0.931 |  |
| 1.687000000000034 | 0.425 | 0.933 |  |
| 1.686500000000034 | 0.425 | 0.935 |  |
| 1.686000000000034 | 0.426 | 0.936 |  |
| 1.685500000000035 | 0.427 | 0.938 |  |
| 1.685000000000035 | 0.427 | 0.939 |  |
| 1.684500000000035 | 0.428 | 0.941 |  |
| 1.684000000000035 | 0.429 | 0.943 |  |
| 1.683500000000035 | 0.429 | 0.944 |  |
| 1.683000000000035 | 0.43 | 0.946 |  |
| 1.682500000000035 | 0.431 | 0.947 |  |
| 1.682000000000035 | 0.431 | 0.949 |  |
| 1.681500000000035 | 0.432 | 0.951 |  |
| 1.681000000000035 | 0.433 | 0.952 |  |
| 1.680500000000035 | 0.433 | 0.954 |  |
| 1.680000000000035 | 0.434 | 0.955 |  |
| 1.679500000000035 | 0.435 | 0.957 |  |
| 1.679000000000035 | 0.435 | 0.959 |  |
| 1.678500000000035 | 0.436 | 0.96 |  |
| 1.678000000000035 | 0.437 | 0.962 |  |
| 1.677500000000035 | 0.437 | 0.963 |  |
| 1.677000000000035 | 0.438 | 0.965 |  |
| 1.676500000000036 | 0.438 | 0.967 |  |
| 1.676000000000036 | 0.439 | 0.968 |  |
| 1.675500000000036 | 0.44 | 0.97 |  |
| 1.675000000000036 | 0.44 | 0.971 |  |
| 1.674500000000036 | 0.441 | 0.973 |  |
| 1.674000000000036 | 0.442 | 0.975 |  |
| 1.673500000000036 | 0.442 | 0.976 |  |
| 1.673000000000036 | 0.443 | 0.978 |  |
| 1.672500000000036 | 0.444 | 0.98 |  |
| 1.672000000000036 | 0.444 | 0.981 |  |
| 1.671500000000036 | 0.445 | 0.983 |  |
| 1.671000000000036 | 0.446 | 0.984 |  |
| 1.670500000000036 | 0.446 | 0.986 |  |
| 1.670000000000036 | 0.447 | 0.988 |  |
| 1.669500000000036 | 0.448 | 0.989 |  |
| 1.669000000000036 | 0.448 | 0.991 |  |
| 1.668500000000036 | 0.449 | 0.992 |  |
| 1.668000000000036 | 0.449 | 0.994 |  |
| 1.667500000000037 | 0.45 | 0.996 |  |
| 1.667000000000037 | 0.451 | 0.997 |  |
| 1.666500000000037 | 0.451 | 0.999 |  |
| 1.666000000000037 | 0.452 | 1 |  |
| 1.665500000000037 | 0.453 | 1.002 |  |
| 1.665000000000037 | 0.453 | 1.004 |  |
| 1.664500000000037 | 0.454 | 1.005 |  |
| 1.664000000000037 | 0.455 | 1.007 |  |
| 1.663500000000037 | 0.455 | 1.009 |  |
| 1.663000000000037 | 0.456 | 1.01 |  |
| 1.662500000000037 | 0.457 | 1.012 |  |
| 1.662000000000037 | 0.457 | 1.013 |  |
| 1.661500000000037 | 0.458 | 1.015 |  |
| 1.661000000000037 | 0.458 | 1.017 |  |
| 1.660500000000037 | 0.459 | 1.018 |  |
| 1.660000000000037 | 0.46 | 1.02 |  |
| 1.659500000000037 | 0.46 | 1.021 |  |
| 1.659000000000037 | 0.461 | 1.023 |  |
| 1.658500000000038 | 0.462 | 1.025 |  |
| 1.658000000000038 | 0.462 | 1.026 |  |
| 1.657500000000038 | 0.463 | 1.028 |  |
| 1.657000000000038 | 0.464 | 1.03 |  |
| 1.656500000000038 | 0.464 | 1.031 |  |
| 1.656000000000038 | 0.465 | 1.033 |  |
| 1.655500000000038 | 0.466 | 1.034 |  |
| 1.655000000000038 | 0.466 | 1.036 |  |
| 1.654500000000038 | 0.467 | 1.038 |  |
| 1.654000000000038 | 0.468 | 1.039 |  |
| 1.653500000000038 | 0.468 | 1.041 |  |
| 1.653000000000038 | 0.469 | 1.043 |  |
| 1.652500000000038 | 0.469 | 1.044 |  |
| 1.652000000000038 | 0.47 | 1.046 |  |
| 1.651500000000038 | 0.471 | 1.047 |  |
| 1.651000000000038 | 0.471 | 1.049 |  |
| 1.650500000000038 | 0.472 | 1.051 |  |
| 1.650000000000038 | 0.473 | 1.052 |  |
| 1.649500000000039 | 0.473 | 1.054 |  |
| 1.649000000000039 | 0.474 | 1.056 |  |
| 1.648500000000039 | 0.475 | 1.057 |  |
| 1.648000000000039 | 0.475 | 1.059 |  |
| 1.647500000000039 | 0.476 | 1.061 |  |
| 1.647000000000039 | 0.476 | 1.062 |  |
| 1.646500000000039 | 0.477 | 1.064 |  |
| 1.646000000000039 | 0.478 | 1.065 |  |
| 1.645500000000039 | 0.478 | 1.067 |  |
| 1.64500000000004 | 0.479 | 1.069 |  |
| 1.64450000000004 | 0.48 | 1.07 |  |
| 1.64400000000004 | 0.48 | 1.072 |  |
| 1.643500000000039 | 0.481 | 1.074 |  |
| 1.643000000000039 | 0.482 | 1.075 |  |
| 1.642500000000039 | 0.482 | 1.077 |  |
| 1.642000000000039 | 0.483 | 1.079 |  |
| 1.641500000000039 | 0.484 | 1.08 |  |
| 1.641000000000039 | 0.484 | 1.082 |  |
| 1.640500000000039 | 0.485 | 1.083 |  |
| 1.64000000000004 | 0.485 | 1.085 |  |
| 1.63950000000004 | 0.486 | 1.087 |  |
| 1.63900000000004 | 0.487 | 1.088 |  |
| 1.63850000000004 | 0.487 | 1.09 |  |
| 1.63800000000004 | 0.488 | 1.092 |  |
| 1.63750000000004 | 0.489 | 1.093 |  |
| 1.63700000000004 | 0.489 | 1.095 |  |
| 1.63650000000004 | 0.49 | 1.097 |  |
| 1.63600000000004 | 0.491 | 1.098 |  |
| 1.63550000000004 | 0.491 | 1.1 |  |
| 1.63500000000004 | 0.492 | 1.102 |  |
| 1.63450000000004 | 0.493 | 1.103 |  |
| 1.63400000000004 | 0.493 | 1.105 |  |
| 1.63350000000004 | 0.494 | 1.106 |  |
| 1.63300000000004 | 0.494 | 1.108 |  |
| 1.63250000000004 | 0.495 | 1.11 |  |
| 1.63200000000004 | 0.496 | 1.111 |  |
| 1.63150000000004 | 0.496 | 1.113 |  |
| 1.631000000000041 | 0.497 | 1.115 |  |
| 1.630500000000041 | 0.498 | 1.116 |  |
| 1.630000000000041 | 0.498 | 1.118 |  |
| 1.629500000000041 | 0.499 | 1.12 |  |
| 1.629000000000041 | 0.5 | 1.121 |  |
| 1.628500000000041 | 0.5 | 1.123 |  |
| 1.628000000000041 | 0.501 | 1.125 |  |
| 1.627500000000041 | 0.501 | 1.126 |  |
| 1.627000000000041 | 0.502 | 1.128 |  |
| 1.626500000000041 | 0.503 | 1.13 |  |
| 1.626000000000041 | 0.503 | 1.131 |  |
| 1.625500000000041 | 0.504 | 1.133 |  |
| 1.625000000000041 | 0.505 | 1.135 |  |
| 1.624500000000041 | 0.505 | 1.136 |  |
| 1.624000000000041 | 0.506 | 1.138 |  |
| 1.623500000000041 | 0.507 | 1.14 |  |
| 1.623000000000041 | 0.507 | 1.141 |  |
| 1.622500000000041 | 0.508 | 1.143 |  |
| 1.622000000000042 | 0.508 | 1.145 |  |
| 1.621500000000042 | 0.509 | 1.146 |  |
| 1.621000000000042 | 0.51 | 1.148 |  |
| 1.620500000000042 | 0.51 | 1.149 |  |
| 1.620000000000042 | 0.511 | 1.151 |  |
| 1.619500000000042 | 0.512 | 1.153 |  |
| 1.619000000000042 | 0.512 | 1.154 |  |
| 1.618500000000042 | 0.513 | 1.156 |  |
| 1.618000000000042 | 0.514 | 1.158 |  |
| 1.617500000000042 | 0.514 | 1.159 |  |
| 1.617000000000042 | 0.515 | 1.161 |  |
| 1.616500000000042 | 0.515 | 1.163 |  |
| 1.616000000000042 | 0.516 | 1.164 |  |
| 1.615500000000042 | 0.517 | 1.166 |  |
| 1.615000000000042 | 0.517 | 1.168 |  |
| 1.614500000000042 | 0.518 | 1.169 |  |
| 1.614000000000042 | 0.519 | 1.171 |  |
| 1.613500000000042 | 0.519 | 1.173 |  |
| 1.613000000000043 | 0.52 | 1.174 |  |
| 1.612500000000043 | 0.521 | 1.176 |  |
| 1.612000000000043 | 0.521 | 1.178 |  |
| 1.611500000000043 | 0.522 | 1.18 |  |
| 1.611000000000043 | 0.522 | 1.181 |  |
| 1.610500000000043 | 0.523 | 1.183 |  |
| 1.610000000000043 | 0.524 | 1.185 |  |
| 1.609500000000043 | 0.524 | 1.186 |  |
| 1.609000000000043 | 0.525 | 1.188 |  |
| 1.608500000000043 | 0.526 | 1.19 |  |
| 1.608000000000043 | 0.526 | 1.191 |  |
| 1.607500000000043 | 0.527 | 1.193 |  |
| 1.607000000000043 | 0.528 | 1.195 |  |
| 1.606500000000043 | 0.528 | 1.196 |  |
| 1.606000000000043 | 0.529 | 1.198 |  |
| 1.605500000000043 | 0.529 | 1.2 |  |
| 1.605000000000043 | 0.53 | 1.201 |  |
| 1.604500000000043 | 0.531 | 1.203 |  |
| 1.604000000000044 | 0.531 | 1.205 |  |
| 1.603500000000044 | 0.532 | 1.206 |  |
| 1.603000000000044 | 0.533 | 1.208 |  |
| 1.602500000000044 | 0.533 | 1.21 |  |
| 1.602000000000044 | 0.534 | 1.211 |  |
| 1.601500000000044 | 0.534 | 1.213 |  |
| 1.601000000000044 | 0.535 | 1.215 |  |
| 1.600500000000044 | 0.536 | 1.216 |  |
| 1.600000000000044 | 0.536 | 1.218 |  |
| 1.599500000000044 | 0.537 | 1.22 |  |
| 1.599000000000044 | 0.538 | 1.222 |  |
| 1.598500000000044 | 0.538 | 1.223 |  |
| 1.598000000000044 | 0.539 | 1.225 |  |
| 1.597500000000044 | 0.54 | 1.227 |  |
| 1.597000000000044 | 0.54 | 1.228 |  |
| 1.596500000000044 | 0.541 | 1.23 |  |
| 1.596000000000044 | 0.541 | 1.232 |  |
| 1.595500000000045 | 0.542 | 1.233 |  |
| 1.595000000000045 | 0.543 | 1.235 |  |
| 1.594500000000045 | 0.543 | 1.237 |  |
| 1.594000000000045 | 0.544 | 1.238 |  |
| 1.593500000000045 | 0.545 | 1.24 |  |
| 1.593000000000045 | 0.545 | 1.242 |  |
| 1.592500000000045 | 0.546 | 1.244 |  |
| 1.592000000000045 | 0.546 | 1.245 |  |
| 1.591500000000045 | 0.547 | 1.247 |  |
| 1.591000000000045 | 0.548 | 1.249 |  |
| 1.590500000000045 | 0.548 | 1.25 |  |
| 1.590000000000045 | 0.549 | 1.252 |  |
| 1.589500000000045 | 0.55 | 1.254 |  |
| 1.589000000000045 | 0.55 | 1.255 |  |
| 1.588500000000045 | 0.551 | 1.257 |  |
| 1.588000000000045 | 0.552 | 1.259 |  |
| 1.587500000000045 | 0.552 | 1.26 |  |
| 1.587000000000045 | 0.553 | 1.262 |  |
| 1.586500000000046 | 0.553 | 1.264 |  |
| 1.586000000000046 | 0.554 | 1.266 |  |
| 1.585500000000046 | 0.555 | 1.267 |  |
| 1.585000000000046 | 0.555 | 1.269 |  |
| 1.584500000000046 | 0.556 | 1.271 |  |
| 1.584000000000046 | 0.557 | 1.272 |  |
| 1.583500000000046 | 0.557 | 1.274 |  |
| 1.583000000000046 | 0.558 | 1.276 |  |
| 1.582500000000046 | 0.558 | 1.278 |  |
| 1.582000000000046 | 0.559 | 1.279 |  |
| 1.581500000000046 | 0.56 | 1.281 |  |
| 1.581000000000046 | 0.56 | 1.283 |  |
| 1.580500000000046 | 0.561 | 1.284 |  |
| 1.580000000000046 | 0.562 | 1.286 |  |
| 1.579500000000046 | 0.562 | 1.288 |  |
| 1.579000000000046 | 0.563 | 1.29 |  |
| 1.578500000000046 | 0.563 | 1.291 |  |
| 1.578000000000046 | 0.564 | 1.293 |  |
| 1.577500000000047 | 0.565 | 1.295 |  |
| 1.577000000000047 | 0.565 | 1.296 |  |
| 1.576500000000047 | 0.566 | 1.298 |  |
| 1.576000000000047 | 0.567 | 1.3 |  |
| 1.575500000000047 | 0.567 | 1.302 |  |
| 1.575000000000047 | 0.568 | 1.303 |  |
| 1.574500000000047 | 0.569 | 1.305 |  |
| 1.574000000000047 | 0.569 | 1.307 |  |
| 1.573500000000047 | 0.57 | 1.308 |  |
| 1.573000000000047 | 0.57 | 1.31 |  |
| 1.572500000000047 | 0.571 | 1.312 |  |
| 1.572000000000047 | 0.572 | 1.314 |  |
| 1.571500000000047 | 0.572 | 1.315 |  |
| 1.571000000000047 | 0.573 | 1.317 |  |
| 1.570500000000047 | 0.574 | 1.319 |  |
| 1.570000000000047 | 0.574 | 1.32 |  |
| 1.569500000000047 | 0.575 | 1.322 |  |
| 1.569000000000047 | 0.575 | 1.324 |  |
| 1.568500000000048 | 0.576 | 1.326 |  |
| 1.568000000000048 | 0.577 | 1.327 |  |
| 1.567500000000048 | 0.577 | 1.329 |  |
| 1.567000000000048 | 0.578 | 1.331 |  |
| 1.566500000000048 | 0.579 | 1.333 |  |
| 1.566000000000048 | 0.579 | 1.334 |  |
| 1.565500000000048 | 0.58 | 1.336 |  |
| 1.565000000000048 | 0.58 | 1.338 |  |
| 1.564500000000048 | 0.581 | 1.34 |  |
| 1.564000000000048 | 0.582 | 1.341 |  |
| 1.563500000000048 | 0.582 | 1.343 |  |
| 1.563000000000048 | 0.583 | 1.345 |  |
| 1.562500000000048 | 0.584 | 1.346 |  |
| 1.562000000000048 | 0.584 | 1.348 |  |
| 1.561500000000048 | 0.585 | 1.35 |  |
| 1.561000000000048 | 0.585 | 1.352 |  |
| 1.560500000000048 | 0.586 | 1.353 |  |
| 1.560000000000048 | 0.587 | 1.355 |  |
| 1.559500000000049 | 0.587 | 1.357 |  |
| 1.559000000000049 | 0.588 | 1.359 |  |
| 1.558500000000049 | 0.589 | 1.36 |  |
| 1.558000000000049 | 0.589 | 1.362 |  |
| 1.557500000000049 | 0.59 | 1.364 |  |
| 1.557000000000049 | 0.59 | 1.366 |  |
| 1.556500000000049 | 0.591 | 1.367 |  |
| 1.556000000000049 | 0.592 | 1.369 |  |
| 1.555500000000049 | 0.592 | 1.371 |  |
| 1.555000000000049 | 0.593 | 1.373 |  |
| 1.55450000000005 | 0.594 | 1.374 |  |
| 1.55400000000005 | 0.594 | 1.376 |  |
| 1.553500000000049 | 0.595 | 1.378 |  |
| 1.553000000000049 | 0.595 | 1.38 |  |
| 1.552500000000049 | 0.596 | 1.381 |  |
| 1.552000000000049 | 0.597 | 1.383 |  |
| 1.551500000000049 | 0.597 | 1.385 |  |
| 1.551000000000049 | 0.598 | 1.387 |  |
| 1.550500000000049 | 0.599 | 1.388 |  |
| 1.55000000000005 | 0.599 | 1.39 |  |
| 1.54950000000005 | 0.6 | 1.392 |  |
| 1.54900000000005 | 0.6 | 1.394 |  |
| 1.54850000000005 | 0.601 | 1.395 |  |
| 1.54800000000005 | 0.602 | 1.397 |  |
| 1.54750000000005 | 0.602 | 1.399 |  |
| 1.54700000000005 | 0.603 | 1.401 |  |
| 1.54650000000005 | 0.603 | 1.402 |  |
| 1.54600000000005 | 0.604 | 1.404 |  |
| 1.54550000000005 | 0.605 | 1.406 |  |
| 1.54500000000005 | 0.605 | 1.408 |  |
| 1.54450000000005 | 0.606 | 1.409 |  |
| 1.54400000000005 | 0.607 | 1.411 |  |
| 1.54350000000005 | 0.607 | 1.413 |  |
| 1.54300000000005 | 0.608 | 1.415 |  |
| 1.54250000000005 | 0.608 | 1.416 |  |
| 1.54200000000005 | 0.609 | 1.418 |  |
| 1.54150000000005 | 0.61 | 1.42 |  |
| 1.541000000000051 | 0.61 | 1.422 |  |
| 1.540500000000051 | 0.611 | 1.424 |  |
| 1.540000000000051 | 0.612 | 1.425 |  |
| 1.539500000000051 | 0.612 | 1.427 |  |
| 1.539000000000051 | 0.613 | 1.429 |  |
| 1.538500000000051 | 0.613 | 1.431 |  |
| 1.538000000000051 | 0.614 | 1.432 |  |
| 1.537500000000051 | 0.615 | 1.434 |  |
| 1.537000000000051 | 0.615 | 1.436 |  |
| 1.536500000000051 | 0.616 | 1.438 |  |
| 1.536000000000051 | 0.617 | 1.439 |  |
| 1.535500000000051 | 0.617 | 1.441 |  |
| 1.535000000000051 | 0.618 | 1.443 |  |
| 1.534500000000051 | 0.618 | 1.445 |  |
| 1.534000000000051 | 0.619 | 1.447 |  |
| 1.533500000000051 | 0.62 | 1.448 |  |
| 1.533000000000051 | 0.62 | 1.45 |  |
| 1.532500000000051 | 0.621 | 1.452 |  |
| 1.532000000000052 | 0.621 | 1.454 |  |
| 1.531500000000052 | 0.622 | 1.456 |  |
| 1.531000000000052 | 0.623 | 1.457 |  |
| 1.530500000000052 | 0.623 | 1.459 |  |
| 1.530000000000052 | 0.624 | 1.461 |  |
| 1.529500000000052 | 0.625 | 1.463 |  |
| 1.529000000000052 | 0.625 | 1.464 |  |
| 1.528500000000052 | 0.626 | 1.466 |  |
| 1.528000000000052 | 0.626 | 1.468 |  |
| 1.527500000000052 | 0.627 | 1.47 |  |
| 1.527000000000052 | 0.628 | 1.472 |  |
| 1.526500000000052 | 0.628 | 1.473 |  |
| 1.526000000000052 | 0.629 | 1.475 |  |
| 1.525500000000052 | 0.63 | 1.477 |  |
| 1.525000000000052 | 0.63 | 1.479 |  |
| 1.524500000000052 | 0.631 | 1.481 |  |
| 1.524000000000052 | 0.631 | 1.482 |  |
| 1.523500000000052 | 0.632 | 1.484 |  |
| 1.523000000000053 | 0.633 | 1.486 |  |
| 1.522500000000053 | 0.633 | 1.488 |  |
| 1.522000000000053 | 0.634 | 1.49 |  |
| 1.521500000000053 | 0.634 | 1.491 |  |
| 1.521000000000053 | 0.635 | 1.493 |  |
| 1.520500000000053 | 0.636 | 1.495 |  |
| 1.520000000000053 | 0.636 | 1.497 |  |
| 1.519500000000053 | 0.637 | 1.499 |  |
| 1.519000000000053 | 0.638 | 1.5 |  |
| 1.518500000000053 | 0.638 | 1.502 |  |
| 1.518000000000053 | 0.639 | 1.504 |  |
| 1.517500000000053 | 0.639 | 1.506 |  |
| 1.517000000000053 | 0.64 | 1.508 |  |
| 1.516500000000053 | 0.641 | 1.509 |  |
| 1.516000000000053 | 0.641 | 1.511 |  |
| 1.515500000000053 | 0.642 | 1.513 |  |
| 1.515000000000053 | 0.642 | 1.515 |  |
| 1.514500000000053 | 0.643 | 1.517 |  |
| 1.514000000000054 | 0.644 | 1.518 |  |
| 1.513500000000054 | 0.644 | 1.52 |  |
| 1.513000000000054 | 0.645 | 1.522 |  |
| 1.512500000000054 | 0.646 | 1.524 |  |
| 1.512000000000054 | 0.646 | 1.526 |  |
| 1.511500000000054 | 0.647 | 1.527 |  |
| 1.511000000000054 | 0.647 | 1.529 |  |
| 1.510500000000054 | 0.648 | 1.531 |  |
| 1.510000000000054 | 0.649 | 1.533 |  |
| 1.509500000000054 | 0.649 | 1.535 |  |
| 1.509000000000054 | 0.65 | 1.537 |  |
| 1.508500000000054 | 0.65 | 1.538 |  |
| 1.508000000000054 | 0.651 | 1.54 |  |
| 1.507500000000054 | 0.652 | 1.542 |  |
| 1.507000000000054 | 0.652 | 1.544 |  |
| 1.506500000000054 | 0.653 | 1.546 |  |
| 1.506000000000054 | 0.654 | 1.548 |  |
| 1.505500000000054 | 0.654 | 1.549 |  |
| 1.505000000000055 | 0.655 | 1.551 |  |
| 1.504500000000055 | 0.655 | 1.553 |  |
| 1.504000000000055 | 0.656 | 1.555 |  |
| 1.503500000000055 | 0.657 | 1.557 |  |
| 1.503000000000055 | 0.657 | 1.558 |  |
| 1.502500000000055 | 0.658 | 1.56 |  |
| 1.502000000000055 | 0.658 | 1.562 |  |
| 1.501500000000055 | 0.659 | 1.564 |  |
| 1.501000000000055 | 0.66 | 1.566 |  |
| 1.500500000000055 | 0.66 | 1.568 |  |
| 1.500000000000055 | 0.661 | 1.569 |  |
| 1.499500000000055 | 0.661 | 1.571 |  |
| 1.499000000000055 | 0.662 | 1.573 |  |
| 1.498500000000055 | 0.663 | 1.575 |  |
| 1.498000000000055 | 0.663 | 1.577 |  |
| 1.497500000000055 | 0.664 | 1.579 |  |
| 1.497000000000055 | 0.665 | 1.581 |  |
| 1.496500000000055 | 0.665 | 1.582 |  |
| 1.496000000000055 | 0.666 | 1.584 |  |
| 1.495500000000056 | 0.666 | 1.586 |  |
| 1.495000000000056 | 0.667 | 1.588 |  |
| 1.494500000000056 | 0.668 | 1.59 |  |
| 1.494000000000056 | 0.668 | 1.592 |  |
| 1.493500000000056 | 0.669 | 1.593 |  |
| 1.493000000000056 | 0.669 | 1.595 |  |
| 1.492500000000056 | 0.67 | 1.597 |  |
| 1.492000000000056 | 0.671 | 1.599 |  |
| 1.491500000000056 | 0.671 | 1.601 |  |
| 1.491000000000056 | 0.672 | 1.603 |  |
| 1.490500000000056 | 0.672 | 1.605 |  |
| 1.490000000000056 | 0.673 | 1.606 |  |
| 1.489500000000056 | 0.674 | 1.608 |  |
| 1.489000000000056 | 0.674 | 1.61 |  |
| 1.488500000000056 | 0.675 | 1.612 |  |
| 1.488000000000056 | 0.676 | 1.614 |  |
| 1.487500000000056 | 0.676 | 1.616 |  |
| 1.487000000000056 | 0.677 | 1.618 |  |
| 1.486500000000057 | 0.677 | 1.619 |  |
| 1.486000000000057 | 0.678 | 1.621 |  |
| 1.485500000000057 | 0.679 | 1.623 |  |
| 1.485000000000057 | 0.679 | 1.625 |  |
| 1.484500000000057 | 0.68 | 1.627 |  |
| 1.484000000000057 | 0.68 | 1.629 |  |
| 1.483500000000057 | 0.681 | 1.631 |  |
| 1.483000000000057 | 0.682 | 1.633 |  |
| 1.482500000000057 | 0.682 | 1.634 |  |
| 1.482000000000057 | 0.683 | 1.636 |  |
| 1.481500000000057 | 0.683 | 1.638 |  |
| 1.481000000000057 | 0.684 | 1.64 |  |
| 1.480500000000057 | 0.685 | 1.642 |  |
| 1.480000000000057 | 0.685 | 1.644 |  |
| 1.479500000000057 | 0.686 | 1.646 |  |
| 1.479000000000057 | 0.687 | 1.647 |  |
| 1.478500000000057 | 0.687 | 1.649 |  |
| 1.478000000000057 | 0.688 | 1.651 |  |
| 1.477500000000058 | 0.688 | 1.653 |  |
| 1.477000000000058 | 0.689 | 1.655 |  |
| 1.476500000000058 | 0.69 | 1.657 |  |
| 1.476000000000058 | 0.69 | 1.659 |  |
| 1.475500000000058 | 0.691 | 1.661 |  |
| 1.475000000000058 | 0.691 | 1.663 |  |
| 1.474500000000058 | 0.692 | 1.664 |  |
| 1.474000000000058 | 0.693 | 1.666 |  |
| 1.473500000000058 | 0.693 | 1.668 |  |
| 1.473000000000058 | 0.694 | 1.67 |  |
| 1.472500000000058 | 0.694 | 1.672 |  |
| 1.472000000000058 | 0.695 | 1.674 |  |
| 1.471500000000058 | 0.696 | 1.676 |  |
| 1.471000000000058 | 0.696 | 1.678 |  |
| 1.470500000000058 | 0.697 | 1.68 |  |
| 1.470000000000058 | 0.697 | 1.681 |  |
| 1.469500000000058 | 0.698 | 1.683 |  |
| 1.469000000000058 | 0.699 | 1.685 |  |
| 1.468500000000059 | 0.699 | 1.687 |  |
| 1.468000000000059 | 0.7 | 1.689 |  |
| 1.467500000000059 | 0.7 | 1.691 |  |
| 1.467000000000059 | 0.701 | 1.693 |  |
| 1.466500000000059 | 0.702 | 1.695 |  |
| 1.466000000000059 | 0.702 | 1.697 |  |
| 1.465500000000059 | 0.703 | 1.699 |  |
| 1.465000000000059 | 0.703 | 1.7 |  |
| 1.464500000000059 | 0.704 | 1.702 |  |
| 1.464000000000059 | 0.705 | 1.704 |  |
| 1.463500000000059 | 0.705 | 1.706 |  |
| 1.463000000000059 | 0.706 | 1.708 |  |
| 1.462500000000059 | 0.707 | 1.71 |  |
| 1.462000000000059 | 0.707 | 1.712 |  |
| 1.461500000000059 | 0.708 | 1.714 |  |
| 1.461000000000059 | 0.708 | 1.716 |  |
| 1.460500000000059 | 0.709 | 1.718 |  |
| 1.460000000000059 | 0.71 | 1.72 |  |
| 1.459500000000059 | 0.71 | 1.722 |  |
| 1.45900000000006 | 0.711 | 1.723 |  |
| 1.45850000000006 | 0.711 | 1.725 |  |
| 1.45800000000006 | 0.712 | 1.727 |  |
| 1.45750000000006 | 0.713 | 1.729 |  |
| 1.45700000000006 | 0.713 | 1.731 |  |
| 1.45650000000006 | 0.714 | 1.733 |  |
| 1.45600000000006 | 0.714 | 1.735 |  |
| 1.45550000000006 | 0.715 | 1.737 |  |
| 1.45500000000006 | 0.716 | 1.739 |  |
| 1.45450000000006 | 0.716 | 1.741 |  |
| 1.45400000000006 | 0.717 | 1.743 |  |
| 1.45350000000006 | 0.717 | 1.745 |  |
| 1.45300000000006 | 0.718 | 1.747 |  |
| 1.45250000000006 | 0.719 | 1.748 |  |
| 1.45200000000006 | 0.719 | 1.75 |  |
| 1.45150000000006 | 0.72 | 1.752 |  |
| 1.45100000000006 | 0.72 | 1.754 |  |
| 1.45050000000006 | 0.721 | 1.756 |  |
| 1.450000000000061 | 0.722 | 1.758 |  |
| 1.449500000000061 | 0.722 | 1.76 |  |
| 1.449000000000061 | 0.723 | 1.762 |  |
| 1.448500000000061 | 0.723 | 1.764 |  |
| 1.448000000000061 | 0.724 | 1.766 |  |
| 1.447500000000061 | 0.725 | 1.768 |  |
| 1.447000000000061 | 0.725 | 1.77 |  |
| 1.446500000000061 | 0.726 | 1.772 |  |
| 1.446000000000061 | 0.726 | 1.774 |  |
| 1.445500000000061 | 0.727 | 1.776 |  |
| 1.445000000000061 | 0.728 | 1.778 |  |
| 1.444500000000061 | 0.728 | 1.78 |  |
| 1.444000000000061 | 0.729 | 1.782 |  |
| 1.443500000000061 | 0.729 | 1.783 |  |
| 1.443000000000061 | 0.73 | 1.785 |  |
| 1.442500000000061 | 0.731 | 1.787 |  |
| 1.442000000000061 | 0.731 | 1.789 |  |
| 1.441500000000061 | 0.732 | 1.791 |  |
| 1.441000000000062 | 0.732 | 1.793 |  |
| 1.440500000000062 | 0.733 | 1.795 |  |
| 1.440000000000062 | 0.734 | 1.797 |  |
| 1.439500000000062 | 0.734 | 1.799 |  |
| 1.439000000000062 | 0.735 | 1.801 |  |
| 1.438500000000062 | 0.735 | 1.803 |  |
| 1.438000000000062 | 0.736 | 1.805 |  |
| 1.437500000000062 | 0.737 | 1.807 |  |
| 1.437000000000062 | 0.737 | 1.809 |  |
| 1.436500000000062 | 0.738 | 1.811 |  |
| 1.436000000000062 | 0.738 | 1.813 |  |
| 1.435500000000062 | 0.739 | 1.815 |  |
| 1.435000000000062 | 0.74 | 1.817 |  |
| 1.434500000000062 | 0.74 | 1.819 |  |
| 1.434000000000062 | 0.741 | 1.821 |  |
| 1.433500000000062 | 0.741 | 1.823 |  |
| 1.433000000000062 | 0.742 | 1.825 |  |
| 1.432500000000062 | 0.743 | 1.827 |  |
| 1.432000000000063 | 0.743 | 1.829 |  |
| 1.431500000000063 | 0.744 | 1.831 |  |
| 1.431000000000063 | 0.744 | 1.833 |  |
| 1.430500000000063 | 0.745 | 1.835 |  |
| 1.430000000000063 | 0.746 | 1.837 |  |
| 1.429500000000063 | 0.746 | 1.839 |  |
| 1.429000000000063 | 0.747 | 1.841 |  |
| 1.428500000000063 | 0.747 | 1.843 |  |
| 1.428000000000063 | 0.748 | 1.845 |  |
| 1.427500000000063 | 0.749 | 1.847 |  |
| 1.427000000000063 | 0.749 | 1.849 |  |
| 1.426500000000063 | 0.75 | 1.851 |  |
| 1.426000000000063 | 0.75 | 1.853 |  |
| 1.425500000000063 | 0.751 | 1.855 |  |
| 1.425000000000063 | 0.752 | 1.857 |  |
| 1.424500000000063 | 0.752 | 1.859 |  |
| 1.424000000000063 | 0.753 | 1.861 |  |
| 1.423500000000063 | 0.753 | 1.863 |  |
| 1.423000000000064 | 0.754 | 1.865 |  |
| 1.422500000000064 | 0.755 | 1.867 |  |
| 1.422000000000064 | 0.755 | 1.869 |  |
| 1.421500000000064 | 0.756 | 1.871 |  |
| 1.421000000000064 | 0.756 | 1.873 |  |
| 1.420500000000064 | 0.757 | 1.875 |  |
| 1.420000000000064 | 0.758 | 1.877 |  |
| 1.419500000000064 | 0.758 | 1.879 |  |
| 1.419000000000064 | 0.759 | 1.881 |  |
| 1.418500000000064 | 0.759 | 1.883 |  |
| 1.418000000000064 | 0.76 | 1.885 |  |
| 1.417500000000064 | 0.761 | 1.887 |  |
| 1.417000000000064 | 0.761 | 1.889 |  |
| 1.416500000000064 | 0.762 | 1.891 |  |
| 1.416000000000064 | 0.762 | 1.893 |  |
| 1.415500000000064 | 0.763 | 1.895 |  |
| 1.415000000000064 | 0.763 | 1.897 |  |
| 1.414500000000064 | 0.764 | 1.899 |  |
| 1.414000000000065 | 0.765 | 1.901 |  |
| 1.413500000000065 | 0.765 | 1.903 |  |
| 1.413000000000065 | 0.766 | 1.905 |  |
| 1.412500000000065 | 0.766 | 1.907 |  |
| 1.412000000000065 | 0.767 | 1.909 |  |
| 1.411500000000065 | 0.768 | 1.911 |  |
| 1.411000000000065 | 0.768 | 1.913 |  |
| 1.410500000000065 | 0.769 | 1.915 |  |
| 1.410000000000065 | 0.769 | 1.917 |  |
| 1.409500000000065 | 0.77 | 1.919 |  |
| 1.409000000000065 | 0.771 | 1.921 |  |
| 1.408500000000065 | 0.771 | 1.923 |  |
| 1.408000000000065 | 0.772 | 1.925 |  |
| 1.407500000000065 | 0.772 | 1.928 |  |
| 1.407000000000065 | 0.773 | 1.93 |  |
| 1.406500000000065 | 0.774 | 1.932 |  |
| 1.406000000000065 | 0.774 | 1.934 |  |
| 1.405500000000065 | 0.775 | 1.936 |  |
| 1.405000000000066 | 0.775 | 1.938 |  |
| 1.404500000000066 | 0.776 | 1.94 |  |
| 1.404000000000066 | 0.777 | 1.942 |  |
| 1.403500000000066 | 0.777 | 1.944 |  |
| 1.403000000000066 | 0.778 | 1.946 |  |
| 1.402500000000066 | 0.778 | 1.948 |  |
| 1.402000000000066 | 0.779 | 1.95 |  |
| 1.401500000000066 | 0.78 | 1.952 |  |
| 1.401000000000066 | 0.78 | 1.954 |  |
| 1.400500000000066 | 0.781 | 1.956 |  |
| 1.400000000000066 | 0.781 | 1.958 |  |
| 1.399500000000066 | 0.782 | 1.96 |  |
| 1.399000000000066 | 0.782 | 1.963 |  |
| 1.398500000000066 | 0.783 | 1.965 |  |
| 1.398000000000066 | 0.784 | 1.967 |  |
| 1.397500000000066 | 0.784 | 1.969 |  |
| 1.397000000000066 | 0.785 | 1.971 |  |
| 1.396500000000066 | 0.785 | 1.973 |  |
| 1.396000000000066 | 0.786 | 1.975 |  |
| 1.395500000000067 | 0.787 | 1.977 |  |
| 1.395000000000067 | 0.787 | 1.979 |  |
| 1.394500000000067 | 0.788 | 1.981 |  |
| 1.394000000000067 | 0.788 | 1.983 |  |
| 1.393500000000067 | 0.789 | 1.985 |  |
| 1.393000000000067 | 0.79 | 1.988 |  |
| 1.392500000000067 | 0.79 | 1.99 |  |
| 1.392000000000067 | 0.791 | 1.992 |  |
| 1.391500000000067 | 0.791 | 1.994 |  |
| 1.391000000000067 | 0.792 | 1.996 |  |
| 1.390500000000067 | 0.793 | 1.998 |  |
| 1.390000000000067 | 0.793 | 2 |  |
| 1.389500000000067 | 0.794 | 2.002 |  |
| 1.389000000000067 | 0.794 | 2.004 |  |
| 1.388500000000067 | 0.795 | 2.006 |  |
| 1.388000000000067 | 0.795 | 2.009 |  |
| 1.387500000000067 | 0.796 | 2.011 |  |
| 1.387000000000067 | 0.797 | 2.013 |  |
| 1.386500000000068 | 0.797 | 2.015 |  |
| 1.386000000000068 | 0.798 | 2.017 |  |
| 1.385500000000068 | 0.798 | 2.019 |  |
| 1.385000000000068 | 0.799 | 2.021 |  |
| 1.384500000000068 | 0.8 | 2.023 |  |
| 1.384000000000068 | 0.8 | 2.025 |  |
| 1.383500000000068 | 0.801 | 2.028 |  |
| 1.383000000000068 | 0.801 | 2.03 |  |
| 1.382500000000068 | 0.802 | 2.032 |  |
| 1.382000000000068 | 0.803 | 2.034 |  |
| 1.381500000000068 | 0.803 | 2.036 |  |
| 1.381000000000068 | 0.804 | 2.038 |  |
| 1.380500000000068 | 0.804 | 2.04 |  |
| 1.380000000000068 | 0.805 | 2.042 |  |
| 1.379500000000068 | 0.805 | 2.045 |  |
| 1.379000000000068 | 0.806 | 2.047 |  |
| 1.378500000000068 | 0.807 | 2.049 |  |
| 1.378000000000068 | 0.807 | 2.051 |  |
| 1.377500000000069 | 0.808 | 2.053 |  |
| 1.377000000000069 | 0.808 | 2.055 |  |
| 1.376500000000069 | 0.809 | 2.057 |  |
| 1.376000000000069 | 0.81 | 2.06 |  |
| 1.375500000000069 | 0.81 | 2.062 |  |
| 1.375000000000069 | 0.811 | 2.064 |  |
| 1.374500000000069 | 0.811 | 2.066 |  |
| 1.374000000000069 | 0.812 | 2.068 |  |
| 1.373500000000069 | 0.812 | 2.07 |  |
| 1.37300000000007 | 0.813 | 2.072 |  |
| 1.37250000000007 | 0.814 | 2.075 |  |
| 1.37200000000007 | 0.814 | 2.077 |  |
| 1.371500000000069 | 0.815 | 2.079 |  |
| 1.371000000000069 | 0.815 | 2.081 |  |
| 1.370500000000069 | 0.816 | 2.083 |  |
| 1.370000000000069 | 0.817 | 2.085 |  |
| 1.369500000000069 | 0.817 | 2.088 |  |
| 1.369000000000069 | 0.818 | 2.09 |  |
| 1.368500000000069 | 0.818 | 2.092 |  |
| 1.36800000000007 | 0.819 | 2.094 |  |
| 1.36750000000007 | 0.82 | 2.096 |  |
| 1.36700000000007 | 0.82 | 2.099 |  |
| 1.36650000000007 | 0.821 | 2.101 |  |
| 1.36600000000007 | 0.821 | 2.103 |  |
| 1.36550000000007 | 0.822 | 2.105 |  |
| 1.36500000000007 | 0.822 | 2.107 |  |
| 1.36450000000007 | 0.823 | 2.109 |  |
| 1.36400000000007 | 0.824 | 2.112 |  |
| 1.36350000000007 | 0.824 | 2.114 |  |
| 1.36300000000007 | 0.825 | 2.116 |  |
| 1.36250000000007 | 0.825 | 2.118 |  |
| 1.36200000000007 | 0.826 | 2.12 |  |
| 1.36150000000007 | 0.827 | 2.123 |  |
| 1.36100000000007 | 0.827 | 2.125 |  |
| 1.36050000000007 | 0.828 | 2.127 |  |
| 1.36000000000007 | 0.828 | 2.129 |  |
| 1.35950000000007 | 0.829 | 2.131 |  |
| 1.359000000000071 | 0.829 | 2.134 |  |
| 1.358500000000071 | 0.83 | 2.136 |  |
| 1.358000000000071 | 0.831 | 2.138 |  |
| 1.357500000000071 | 0.831 | 2.14 |  |
| 1.357000000000071 | 0.832 | 2.142 |  |
| 1.356500000000071 | 0.832 | 2.145 |  |
| 1.356000000000071 | 0.833 | 2.147 |  |
| 1.355500000000071 | 0.834 | 2.149 |  |
| 1.355000000000071 | 0.834 | 2.151 |  |
| 1.354500000000071 | 0.835 | 2.154 |  |
| 1.354000000000071 | 0.835 | 2.156 |  |
| 1.353500000000071 | 0.836 | 2.158 |  |
| 1.353000000000071 | 0.836 | 2.16 |  |
| 1.352500000000071 | 0.837 | 2.162 |  |
| 1.352000000000071 | 0.838 | 2.165 |  |
| 1.351500000000071 | 0.838 | 2.167 |  |
| 1.351000000000071 | 0.839 | 2.169 |  |
| 1.350500000000071 | 0.839 | 2.171 |  |
| 1.350000000000072 | 0.84 | 2.174 |  |
| 1.349500000000072 | 0.84 | 2.176 |  |
| 1.349000000000072 | 0.841 | 2.178 |  |
| 1.348500000000072 | 0.842 | 2.18 |  |
| 1.348000000000072 | 0.842 | 2.183 |  |
| 1.347500000000072 | 0.843 | 2.185 |  |
| 1.347000000000072 | 0.843 | 2.187 |  |
| 1.346500000000072 | 0.844 | 2.189 |  |
| 1.346000000000072 | 0.845 | 2.192 |  |
| 1.345500000000072 | 0.845 | 2.194 |  |
| 1.345000000000072 | 0.846 | 2.196 |  |
| 1.344500000000072 | 0.846 | 2.198 |  |
| 1.344000000000072 | 0.847 | 2.201 |  |
| 1.343500000000072 | 0.847 | 2.203 |  |
| 1.343000000000072 | 0.848 | 2.205 |  |
| 1.342500000000072 | 0.849 | 2.207 |  |
| 1.342000000000072 | 0.849 | 2.21 |  |
| 1.341500000000072 | 0.85 | 2.212 |  |
| 1.341000000000073 | 0.85 | 2.214 |  |
| 1.340500000000073 | 0.851 | 2.217 |  |
| 1.340000000000073 | 0.852 | 2.219 |  |
| 1.339500000000073 | 0.852 | 2.221 |  |
| 1.339000000000073 | 0.853 | 2.223 |  |
| 1.338500000000073 | 0.853 | 2.226 |  |
| 1.338000000000073 | 0.854 | 2.228 |  |
| 1.337500000000073 | 0.854 | 2.23 |  |
| 1.337000000000073 | 0.855 | 2.233 |  |
| 1.336500000000073 | 0.856 | 2.235 |  |
| 1.336000000000073 | 0.856 | 2.237 |  |
| 1.335500000000073 | 0.857 | 2.239 |  |
| 1.335000000000073 | 0.857 | 2.242 |  |
| 1.334500000000073 | 0.858 | 2.244 |  |
| 1.334000000000073 | 0.858 | 2.246 |  |
| 1.333500000000073 | 0.859 | 2.249 |  |
| 1.333000000000073 | 0.86 | 2.251 |  |
| 1.332500000000073 | 0.86 | 2.253 |  |
| 1.332000000000074 | 0.861 | 2.256 |  |
| 1.331500000000074 | 0.861 | 2.258 |  |
| 1.331000000000074 | 0.862 | 2.26 |  |
| 1.330500000000074 | 0.862 | 2.263 |  |
| 1.330000000000074 | 0.863 | 2.265 |  |
| 1.329500000000074 | 0.864 | 2.267 |  |
| 1.329000000000074 | 0.864 | 2.27 |  |
| 1.328500000000074 | 0.865 | 2.272 |  |
| 1.328000000000074 | 0.865 | 2.274 |  |
| 1.327500000000074 | 0.866 | 2.277 |  |
| 1.327000000000074 | 0.867 | 2.279 |  |
| 1.326500000000074 | 0.867 | 2.281 |  |
| 1.326000000000074 | 0.868 | 2.284 |  |
| 1.325500000000074 | 0.868 | 2.286 |  |
| 1.325000000000074 | 0.869 | 2.288 |  |
| 1.324500000000074 | 0.869 | 2.291 |  |
| 1.324000000000074 | 0.87 | 2.293 |  |
| 1.323500000000074 | 0.871 | 2.295 |  |
| 1.323000000000075 | 0.871 | 2.298 |  |
| 1.322500000000075 | 0.872 | 2.3 |  |
| 1.322000000000075 | 0.872 | 2.302 |  |
| 1.321500000000075 | 0.873 | 2.305 |  |
| 1.321000000000075 | 0.873 | 2.307 |  |
| 1.320500000000075 | 0.874 | 2.309 |  |
| 1.320000000000075 | 0.875 | 2.312 |  |
| 1.319500000000075 | 0.875 | 2.314 |  |
| 1.319000000000075 | 0.876 | 2.317 |  |
| 1.318500000000075 | 0.876 | 2.319 |  |
| 1.318000000000075 | 0.877 | 2.321 |  |
| 1.317500000000075 | 0.877 | 2.324 |  |
| 1.317000000000075 | 0.878 | 2.326 |  |
| 1.316500000000075 | 0.879 | 2.328 |  |
| 1.316000000000075 | 0.879 | 2.331 |  |
| 1.315500000000075 | 0.88 | 2.333 |  |
| 1.315000000000075 | 0.88 | 2.336 |  |
| 1.314500000000075 | 0.881 | 2.338 |  |
| 1.314000000000076 | 0.881 | 2.34 |  |
| 1.313500000000076 | 0.882 | 2.343 |  |
| 1.313000000000076 | 0.883 | 2.345 |  |
| 1.312500000000076 | 0.883 | 2.348 |  |
| 1.312000000000076 | 0.884 | 2.35 |  |
| 1.311500000000076 | 0.884 | 2.352 |  |
| 1.311000000000076 | 0.885 | 2.355 |  |
| 1.310500000000076 | 0.885 | 2.357 |  |
| 1.310000000000076 | 0.886 | 2.36 |  |
| 1.309500000000076 | 0.887 | 2.362 |  |
| 1.309000000000076 | 0.887 | 2.365 |  |
| 1.308500000000076 | 0.888 | 2.367 |  |
| 1.308000000000076 | 0.888 | 2.369 |  |
| 1.307500000000076 | 0.889 | 2.372 |  |
| 1.307000000000076 | 0.889 | 2.374 |  |
| 1.306500000000076 | 0.89 | 2.377 |  |
| 1.306000000000076 | 0.891 | 2.379 |  |
| 1.305500000000076 | 0.891 | 2.382 |  |
| 1.305000000000076 | 0.892 | 2.384 |  |
| 1.304500000000077 | 0.892 | 2.386 |  |
| 1.304000000000077 | 0.893 | 2.389 |  |
| 1.303500000000077 | 0.893 | 2.391 |  |
| 1.303000000000077 | 0.894 | 2.394 |  |
| 1.302500000000077 | 0.895 | 2.396 |  |
| 1.302000000000077 | 0.895 | 2.399 |  |
| 1.301500000000077 | 0.896 | 2.401 |  |
| 1.301000000000077 | 0.896 | 2.404 |  |
| 1.300500000000077 | 0.897 | 2.406 |  |
| 1.300000000000077 | 0.897 | 2.409 |  |
| 1.299500000000077 | 0.898 | 2.411 |  |
| 1.299000000000077 | 0.899 | 2.413 |  |
| 1.298500000000077 | 0.899 | 2.416 |  |
| 1.298000000000077 | 0.9 | 2.418 |  |
| 1.297500000000077 | 0.9 | 2.421 |  |
| 1.297000000000077 | 0.901 | 2.423 |  |
| 1.296500000000077 | 0.901 | 2.426 |  |
| 1.296000000000077 | 0.902 | 2.428 |  |
| 1.295500000000078 | 0.903 | 2.431 |  |
| 1.295000000000078 | 0.903 | 2.433 |  |
| 1.294500000000078 | 0.904 | 2.436 |  |
| 1.294000000000078 | 0.904 | 2.438 |  |
| 1.293500000000078 | 0.905 | 2.441 |  |
| 1.293000000000078 | 0.905 | 2.443 |  |
| 1.292500000000078 | 0.906 | 2.446 |  |
| 1.292000000000078 | 0.907 | 2.448 |  |
| 1.291500000000078 | 0.907 | 2.451 |  |
| 1.291000000000078 | 0.908 | 2.453 |  |
| 1.290500000000078 | 0.908 | 2.456 |  |
| 1.290000000000078 | 0.909 | 2.459 |  |
| 1.289500000000078 | 0.909 | 2.461 |  |
| 1.289000000000078 | 0.91 | 2.464 |  |
| 1.288500000000078 | 0.911 | 2.466 |  |
| 1.288000000000078 | 0.911 | 2.469 |  |
| 1.287500000000078 | 0.912 | 2.471 |  |
| 1.287000000000078 | 0.912 | 2.474 |  |
| 1.286500000000079 | 0.913 | 2.476 |  |
| 1.286000000000079 | 0.913 | 2.479 |  |
| 1.285500000000079 | 0.914 | 2.481 |  |
| 1.285000000000079 | 0.915 | 2.484 |  |
| 1.284500000000079 | 0.915 | 2.486 |  |
| 1.284000000000079 | 0.916 | 2.489 |  |
| 1.283500000000079 | 0.916 | 2.492 |  |
| 1.283000000000079 | 0.917 | 2.494 |  |
| 1.282500000000079 | 0.917 | 2.497 |  |
| 1.28200000000008 | 0.918 | 2.499 |  |
| 1.281500000000079 | 0.918 | 2.502 |  |
| 1.281000000000079 | 0.919 | 2.504 |  |
| 1.280500000000079 | 0.92 | 2.507 |  |
| 1.280000000000079 | 0.92 | 2.51 |  |
| 1.279500000000079 | 0.921 | 2.512 |  |
| 1.279000000000079 | 0.921 | 2.515 |  |
| 1.278500000000079 | 0.922 | 2.517 |  |
| 1.278000000000079 | 0.922 | 2.52 |  |
| 1.27750000000008 | 0.923 | 2.523 |  |
| 1.27700000000008 | 0.924 | 2.525 |  |
| 1.27650000000008 | 0.924 | 2.528 |  |
| 1.27600000000008 | 0.925 | 2.53 |  |
| 1.27550000000008 | 0.925 | 2.533 |  |
| 1.27500000000008 | 0.926 | 2.536 |  |
| 1.27450000000008 | 0.926 | 2.538 |  |
| 1.27400000000008 | 0.927 | 2.541 |  |
| 1.27350000000008 | 0.928 | 2.544 |  |
| 1.27300000000008 | 0.928 | 2.546 |  |
| 1.27250000000008 | 0.929 | 2.549 |  |
| 1.27200000000008 | 0.929 | 2.551 |  |
| 1.27150000000008 | 0.93 | 2.554 |  |
| 1.27100000000008 | 0.93 | 2.557 |  |
| 1.27050000000008 | 0.931 | 2.559 |  |
| 1.27000000000008 | 0.931 | 2.562 |  |
| 1.26950000000008 | 0.932 | 2.565 |  |
| 1.26900000000008 | 0.933 | 2.567 |  |
| 1.268500000000081 | 0.933 | 2.57 |  |
| 1.268000000000081 | 0.934 | 2.573 |  |
| 1.267500000000081 | 0.934 | 2.575 |  |
| 1.267000000000081 | 0.935 | 2.578 |  |
| 1.266500000000081 | 0.935 | 2.581 |  |
| 1.266000000000081 | 0.936 | 2.583 |  |
| 1.265500000000081 | 0.937 | 2.586 |  |
| 1.265000000000081 | 0.937 | 2.589 |  |
| 1.264500000000081 | 0.938 | 2.591 |  |
| 1.264000000000081 | 0.938 | 2.594 |  |
| 1.263500000000081 | 0.939 | 2.597 |  |
| 1.263000000000081 | 0.939 | 2.599 |  |
| 1.262500000000081 | 0.94 | 2.602 |  |
| 1.262000000000081 | 0.94 | 2.605 |  |
| 1.261500000000081 | 0.941 | 2.608 |  |
| 1.261000000000081 | 0.942 | 2.61 |  |
| 1.260500000000081 | 0.942 | 2.613 |  |
| 1.260000000000081 | 0.943 | 2.616 |  |
| 1.259500000000082 | 0.943 | 2.618 |  |
| 1.259000000000082 | 0.944 | 2.621 |  |
| 1.258500000000082 | 0.944 | 2.624 |  |
| 1.258000000000082 | 0.945 | 2.627 |  |
| 1.257500000000082 | 0.946 | 2.629 |  |
| 1.257000000000082 | 0.946 | 2.632 |  |
| 1.256500000000082 | 0.947 | 2.635 |  |
| 1.256000000000082 | 0.947 | 2.638 |  |
| 1.255500000000082 | 0.948 | 2.64 |  |
| 1.255000000000082 | 0.948 | 2.643 |  |
| 1.254500000000082 | 0.949 | 2.646 |  |
| 1.254000000000082 | 0.949 | 2.649 |  |
| 1.253500000000082 | 0.95 | 2.651 |  |
| 1.253000000000082 | 0.951 | 2.654 |  |
| 1.252500000000082 | 0.951 | 2.657 |  |
| 1.252000000000082 | 0.952 | 2.66 |  |
| 1.251500000000082 | 0.952 | 2.662 |  |
| 1.251000000000082 | 0.953 | 2.665 |  |
| 1.250500000000083 | 0.953 | 2.668 |  |
| 1.250000000000083 | 0.954 | 2.671 |  |
| 1.249500000000083 | 0.954 | 2.674 |  |
| 1.249000000000083 | 0.955 | 2.676 |  |
| 1.248500000000083 | 0.956 | 2.679 |  |
| 1.248000000000083 | 0.956 | 2.682 |  |
| 1.247500000000083 | 0.957 | 2.685 |  |
| 1.247000000000083 | 0.957 | 2.688 |  |
| 1.246500000000083 | 0.958 | 2.69 |  |
| 1.246000000000083 | 0.958 | 2.693 |  |
| 1.245500000000083 | 0.959 | 2.696 |  |
| 1.245000000000083 | 0.96 | 2.699 |  |
| 1.244500000000083 | 0.96 | 2.702 |  |
| 1.244000000000083 | 0.961 | 2.705 |  |
| 1.243500000000083 | 0.961 | 2.707 |  |
| 1.243000000000083 | 0.962 | 2.71 |  |
| 1.242500000000083 | 0.962 | 2.713 |  |
| 1.242000000000083 | 0.963 | 2.716 |  |
| 1.241500000000084 | 0.963 | 2.719 |  |
| 1.241000000000084 | 0.964 | 2.722 |  |
| 1.240500000000084 | 0.965 | 2.725 |  |
| 1.240000000000084 | 0.965 | 2.728 |  |
| 1.239500000000084 | 0.966 | 2.73 |  |
| 1.239000000000084 | 0.966 | 2.733 |  |
| 1.238500000000084 | 0.967 | 2.736 |  |
| 1.238000000000084 | 0.967 | 2.739 |  |
| 1.237500000000084 | 0.968 | 2.742 |  |
| 1.237000000000084 | 0.968 | 2.745 |  |
| 1.236500000000084 | 0.969 | 2.748 |  |
| 1.236000000000084 | 0.97 | 2.751 |  |
| 1.235500000000084 | 0.97 | 2.754 |  |
| 1.235000000000084 | 0.971 | 2.756 |  |
| 1.234500000000084 | 0.971 | 2.759 |  |
| 1.234000000000084 | 0.972 | 2.762 |  |
| 1.233500000000084 | 0.972 | 2.765 |  |
| 1.233000000000084 | 0.973 | 2.768 |  |
| 1.232500000000085 | 0.973 | 2.771 |  |
| 1.232000000000085 | 0.974 | 2.774 |  |
| 1.231500000000085 | 0.975 | 2.777 |  |
| 1.231000000000085 | 0.975 | 2.78 |  |
| 1.230500000000085 | 0.976 | 2.783 |  |
| 1.230000000000085 | 0.976 | 2.786 |  |
| 1.229500000000085 | 0.977 | 2.789 |  |
| 1.229000000000085 | 0.977 | 2.792 |  |
| 1.228500000000085 | 0.978 | 2.795 |  |
| 1.228000000000085 | 0.978 | 2.798 |  |
| 1.227500000000085 | 0.979 | 2.801 |  |
| 1.227000000000085 | 0.98 | 2.804 |  |
| 1.226500000000085 | 0.98 | 2.807 |  |
| 1.226000000000085 | 0.981 | 2.81 |  |
| 1.225500000000085 | 0.981 | 2.813 |  |
| 1.225000000000085 | 0.982 | 2.816 |  |
| 1.224500000000085 | 0.982 | 2.819 |  |
| 1.224000000000085 | 0.983 | 2.822 |  |
| 1.223500000000086 | 0.983 | 2.825 |  |
| 1.223000000000086 | 0.984 | 2.828 |  |
| 1.222500000000086 | 0.984 | 2.831 |  |
| 1.222000000000086 | 0.985 | 2.834 |  |
| 1.221500000000086 | 0.986 | 2.837 |  |
| 1.221000000000086 | 0.986 | 2.84 |  |
| 1.220500000000086 | 0.987 | 2.843 |  |
| 1.220000000000086 | 0.987 | 2.846 |  |
| 1.219500000000086 | 0.988 | 2.849 |  |
| 1.219000000000086 | 0.988 | 2.852 |  |
| 1.218500000000086 | 0.989 | 2.855 |  |
| 1.218000000000086 | 0.989 | 2.858 |  |
| 1.217500000000086 | 0.99 | 2.862 |  |
| 1.217000000000086 | 0.991 | 2.865 |  |
| 1.216500000000086 | 0.991 | 2.868 |  |
| 1.216000000000086 | 0.992 | 2.871 |  |
| 1.215500000000086 | 0.992 | 2.874 |  |
| 1.215000000000086 | 0.993 | 2.877 |  |
| 1.214500000000086 | 0.993 | 2.88 |  |
| 1.214000000000087 | 0.994 | 2.883 |  |
| 1.213500000000087 | 0.994 | 2.886 |  |
| 1.213000000000087 | 0.995 | 2.89 |  |
| 1.212500000000087 | 0.996 | 2.893 |  |
| 1.212000000000087 | 0.996 | 2.896 |  |
| 1.211500000000087 | 0.997 | 2.899 |  |
| 1.211000000000087 | 0.997 | 2.902 |  |
| 1.210500000000087 | 0.998 | 2.905 |  |
| 1.210000000000087 | 0.998 | 2.908 |  |
| 1.209500000000087 | 0.999 | 2.912 |  |
| 1.209000000000087 | 0.999 | 2.915 |  |
| 1.208500000000087 | 1 | 2.918 |  |
| 1.208000000000087 | 1 | 2.921 |  |
| 1.207500000000087 | 1.001 | 2.924 |  |
| 1.207000000000087 | 1.002 | 2.928 |  |
| 1.206500000000087 | 1.002 | 2.931 |  |
| 1.206000000000087 | 1.003 | 2.934 |  |
| 1.205500000000087 | 1.003 | 2.937 |  |
| 1.205000000000088 | 1.004 | 2.94 |  |
| 1.204500000000088 | 1.004 | 2.944 |  |
| 1.204000000000088 | 1.005 | 2.947 |  |
| 1.203500000000088 | 1.005 | 2.95 |  |
| 1.203000000000088 | 1.006 | 2.953 |  |
| 1.202500000000088 | 1.007 | 2.957 |  |
| 1.202000000000088 | 1.007 | 2.96 |  |
| 1.201500000000088 | 1.008 | 2.963 |  |
| 1.201000000000088 | 1.008 | 2.966 |  |
| 1.200500000000088 | 1.009 | 2.97 |  |
| 1.200000000000088 | 1.009 | 2.973 |  |
| 1.199500000000088 | 1.01 | 2.976 |  |
| 1.199000000000088 | 1.01 | 2.98 |  |
| 1.198500000000088 | 1.011 | 2.983 |  |
| 1.198000000000088 | 1.011 | 2.986 |  |
| 1.197500000000088 | 1.012 | 2.99 |  |
| 1.197000000000088 | 1.013 | 2.993 |  |
| 1.196500000000088 | 1.013 | 2.996 |  |
| 1.196000000000089 | 1.014 | 3 |  |
| 1.195500000000089 | 1.014 | 3.003 |  |
| 1.195000000000089 | 1.015 | 3.006 |  |
| 1.194500000000089 | 1.015 | 3.01 |  |
| 1.194000000000089 | 1.016 | 3.013 |  |
| 1.193500000000089 | 1.016 | 3.016 |  |
| 1.193000000000089 | 1.017 | 3.02 |  |
| 1.192500000000089 | 1.017 | 3.023 |  |
| 1.192000000000089 | 1.018 | 3.026 |  |
| 1.19150000000009 | 1.019 | 3.03 |  |
| 1.19100000000009 | 1.019 | 3.033 |  |
| 1.19050000000009 | 1.02 | 3.037 |  |
| 1.19000000000009 | 1.02 | 3.04 |  |
| 1.189500000000089 | 1.021 | 3.043 |  |
| 1.189000000000089 | 1.021 | 3.047 |  |
| 1.188500000000089 | 1.022 | 3.05 |  |
| 1.188000000000089 | 1.022 | 3.054 |  |
| 1.187500000000089 | 1.023 | 3.057 |  |
| 1.18700000000009 | 1.023 | 3.061 |  |
| 1.18650000000009 | 1.024 | 3.064 |  |
| 1.18600000000009 | 1.025 | 3.068 |  |
| 1.18550000000009 | 1.025 | 3.071 |  |
| 1.18500000000009 | 1.026 | 3.075 |  |
| 1.18450000000009 | 1.026 | 3.078 |  |
| 1.18400000000009 | 1.027 | 3.082 |  |
| 1.18350000000009 | 1.027 | 3.085 |  |
| 1.18300000000009 | 1.028 | 3.089 |  |
| 1.18250000000009 | 1.028 | 3.092 |  |
| 1.18200000000009 | 1.029 | 3.096 |  |
| 1.18150000000009 | 1.029 | 3.099 |  |
| 1.18100000000009 | 1.03 | 3.103 |  |
| 1.18050000000009 | 1.031 | 3.106 |  |
| 1.18000000000009 | 1.031 | 3.11 |  |
| 1.17950000000009 | 1.032 | 3.113 |  |
| 1.17900000000009 | 1.032 | 3.117 |  |
| 1.17850000000009 | 1.033 | 3.12 |  |
| 1.178000000000091 | 1.033 | 3.124 |  |
| 1.177500000000091 | 1.034 | 3.128 |  |
| 1.177000000000091 | 1.034 | 3.131 |  |
| 1.176500000000091 | 1.035 | 3.135 |  |
| 1.176000000000091 | 1.035 | 3.138 |  |
| 1.175500000000091 | 1.036 | 3.142 |  |
| 1.175000000000091 | 1.037 | 3.146 |  |
| 1.174500000000091 | 1.037 | 3.149 |  |
| 1.174000000000091 | 1.038 | 3.153 |  |
| 1.173500000000091 | 1.038 | 3.157 |  |
| 1.173000000000091 | 1.039 | 3.16 |  |
| 1.172500000000091 | 1.039 | 3.164 |  |
| 1.172000000000091 | 1.04 | 3.168 |  |
| 1.171500000000091 | 1.04 | 3.171 |  |
| 1.171000000000091 | 1.041 | 3.175 |  |
| 1.170500000000091 | 1.041 | 3.179 |  |
| 1.170000000000091 | 1.042 | 3.183 |  |
| 1.169500000000091 | 1.042 | 3.186 |  |
| 1.169000000000092 | 1.043 | 3.19 |  |
| 1.168500000000092 | 1.044 | 3.194 |  |
| 1.168000000000092 | 1.044 | 3.198 |  |
| 1.167500000000092 | 1.045 | 3.201 |  |
| 1.167000000000092 | 1.045 | 3.205 |  |
| 1.166500000000092 | 1.046 | 3.209 |  |
| 1.166000000000092 | 1.046 | 3.213 |  |
| 1.165500000000092 | 1.047 | 3.216 |  |
| 1.165000000000092 | 1.047 | 3.22 |  |
| 1.164500000000092 | 1.048 | 3.224 |  |
| 1.164000000000092 | 1.048 | 3.228 |  |
| 1.163500000000092 | 1.049 | 3.232 |  |
| 1.163000000000092 | 1.049 | 3.236 |  |
| 1.162500000000092 | 1.05 | 3.239 |  |
| 1.162000000000092 | 1.051 | 3.243 |  |
| 1.161500000000092 | 1.051 | 3.247 |  |
| 1.161000000000092 | 1.052 | 3.251 |  |
| 1.160500000000092 | 1.052 | 3.255 |  |
| 1.160000000000092 | 1.053 | 3.259 |  |
| 1.159500000000093 | 1.053 | 3.263 |  |
| 1.159000000000093 | 1.054 | 3.267 |  |
| 1.158500000000093 | 1.054 | 3.271 |  |
| 1.158000000000093 | 1.055 | 3.274 |  |
| 1.157500000000093 | 1.055 | 3.278 |  |
| 1.157000000000093 | 1.056 | 3.282 |  |
| 1.156500000000093 | 1.056 | 3.286 |  |
| 1.156000000000093 | 1.057 | 3.29 |  |
| 1.155500000000093 | 1.058 | 3.294 |  |
| 1.155000000000093 | 1.058 | 3.298 |  |
| 1.154500000000093 | 1.059 | 3.302 |  |
| 1.154000000000093 | 1.059 | 3.306 |  |
| 1.153500000000093 | 1.06 | 3.31 |  |
| 1.153000000000093 | 1.06 | 3.314 |  |
| 1.152500000000093 | 1.061 | 3.318 |  |
| 1.152000000000093 | 1.061 | 3.323 |  |
| 1.151500000000093 | 1.062 | 3.327 |  |
| 1.151000000000093 | 1.062 | 3.331 |  |
| 1.150500000000094 | 1.063 | 3.335 |  |
| 1.150000000000094 | 1.063 | 3.339 |  |
| 1.149500000000094 | 1.064 | 3.343 |  |
| 1.149000000000094 | 1.065 | 3.347 |  |
| 1.148500000000094 | 1.065 | 3.351 |  |
| 1.148000000000094 | 1.066 | 3.355 |  |
| 1.147500000000094 | 1.066 | 3.36 |  |
| 1.147000000000094 | 1.067 | 3.364 |  |
| 1.146500000000094 | 1.067 | 3.368 |  |
| 1.146000000000094 | 1.068 | 3.372 |  |
| 1.145500000000094 | 1.068 | 3.376 |  |
| 1.145000000000094 | 1.069 | 3.381 |  |
| 1.144500000000094 | 1.069 | 3.385 |  |
| 1.144000000000094 | 1.07 | 3.389 |  |
| 1.143500000000094 | 1.07 | 3.393 |  |
| 1.143000000000094 | 1.071 | 3.398 |  |
| 1.142500000000094 | 1.071 | 3.402 |  |
| 1.142000000000094 | 1.072 | 3.406 |  |
| 1.141500000000095 | 1.073 | 3.41 |  |
| 1.141000000000095 | 1.073 | 3.415 |  |
| 1.140500000000095 | 1.074 | 3.419 |  |
| 1.140000000000095 | 1.074 | 3.423 |  |
| 1.139500000000095 | 1.075 | 3.428 |  |
| 1.139000000000095 | 1.075 | 3.432 |  |
| 1.138500000000095 | 1.076 | 3.437 |  |
| 1.138000000000095 | 1.076 | 3.441 |  |
| 1.137500000000095 | 1.077 | 3.445 |  |
| 1.137000000000095 | 1.077 | 3.45 |  |
| 1.136500000000095 | 1.078 | 3.454 |  |
| 1.136000000000095 | 1.078 | 3.459 |  |
| 1.135500000000095 | 1.079 | 3.463 |  |
| 1.135000000000095 | 1.079 | 3.468 |  |
| 1.134500000000095 | 1.08 | 3.472 |  |
| 1.134000000000095 | 1.081 | 3.477 |  |
| 1.133500000000095 | 1.081 | 3.481 |  |
| 1.133000000000095 | 1.082 | 3.486 |  |
| 1.132500000000096 | 1.082 | 3.49 |  |
| 1.132000000000096 | 1.083 | 3.495 |  |
| 1.131500000000096 | 1.083 | 3.499 |  |
| 1.131000000000096 | 1.084 | 3.504 |  |
| 1.130500000000096 | 1.084 | 3.508 |  |
| 1.130000000000096 | 1.085 | 3.513 |  |
| 1.129500000000096 | 1.085 | 3.518 |  |
| 1.129000000000096 | 1.086 | 3.522 |  |
| 1.128500000000096 | 1.086 | 3.527 |  |
| 1.128000000000096 | 1.087 | 3.532 |  |
| 1.127500000000096 | 1.087 | 3.536 |  |
| 1.127000000000096 | 1.088 | 3.541 |  |
| 1.126500000000096 | 1.089 | 3.546 |  |
| 1.126000000000096 | 1.089 | 3.55 |  |
| 1.125500000000096 | 1.09 | 3.555 |  |
| 1.125000000000096 | 1.09 | 3.56 |  |
| 1.124500000000096 | 1.091 | 3.565 |  |
| 1.124000000000096 | 1.091 | 3.57 |  |
| 1.123500000000097 | 1.092 | 3.574 |  |
| 1.123000000000097 | 1.092 | 3.579 |  |
| 1.122500000000097 | 1.093 | 3.584 |  |
| 1.122000000000097 | 1.093 | 3.589 |  |
| 1.121500000000097 | 1.094 | 3.594 |  |
| 1.121000000000097 | 1.094 | 3.599 |  |
| 1.120500000000097 | 1.095 | 3.604 |  |
| 1.120000000000097 | 1.095 | 3.609 |  |
| 1.119500000000097 | 1.096 | 3.613 |  |
| 1.119000000000097 | 1.096 | 3.618 |  |
| 1.118500000000097 | 1.097 | 3.623 |  |
| 1.118000000000097 | 1.098 | 3.628 |  |
| 1.117500000000097 | 1.098 | 3.633 |  |
| 1.117000000000097 | 1.099 | 3.638 |  |
| 1.116500000000097 | 1.099 | 3.644 |  |
| 1.116000000000097 | 1.1 | 3.649 |  |
| 1.115500000000097 | 1.1 | 3.654 |  |
| 1.115000000000097 | 1.101 | 3.659 |  |
| 1.114500000000098 | 1.101 | 3.664 |  |
| 1.114000000000098 | 1.102 | 3.669 |  |
| 1.113500000000098 | 1.102 | 3.674 |  |
| 1.113000000000098 | 1.103 | 3.679 |  |
| 1.112500000000098 | 1.103 | 3.685 |  |
| 1.112000000000098 | 1.104 | 3.69 |  |
| 1.111500000000098 | 1.104 | 3.695 |  |
| 1.111000000000098 | 1.105 | 3.7 |  |
| 1.110500000000098 | 1.105 | 3.706 |  |
| 1.110000000000098 | 1.106 | 3.711 |  |
| 1.109500000000098 | 1.107 | 3.716 |  |
| 1.109000000000098 | 1.107 | 3.722 |  |
| 1.108500000000098 | 1.108 | 3.727 |  |
| 1.108000000000098 | 1.108 | 3.732 |  |
| 1.107500000000098 | 1.109 | 3.738 |  |
| 1.107000000000098 | 1.109 | 3.743 |  |
| 1.106500000000098 | 1.11 | 3.749 |  |
| 1.106000000000098 | 1.11 | 3.754 |  |
| 1.105500000000099 | 1.111 | 3.76 |  |
| 1.105000000000099 | 1.111 | 3.765 |  |
| 1.104500000000099 | 1.112 | 3.771 |  |
| 1.104000000000099 | 1.112 | 3.776 |  |
| 1.103500000000099 | 1.113 | 3.782 |  |
| 1.103000000000099 | 1.113 | 3.787 |  |
| 1.102500000000099 | 1.114 | 3.793 |  |
| 1.102000000000099 | 1.114 | 3.799 |  |
| 1.101500000000099 | 1.115 | 3.804 |  |
| 1.1010000000001 | 1.115 | 3.81 |  |
| 1.1005000000001 | 1.116 | 3.816 |  |
| 1.1000000000001 | 1.116 | 3.822 |  |
| 1.099500000000099 | 1.117 | 3.827 |  |
| 1.099000000000099 | 1.118 | 3.833 |  |
| 1.098500000000099 | 1.118 | 3.839 |  |
| 1.098000000000099 | 1.119 | 3.845 |  |
| 1.097500000000099 | 1.119 | 3.851 |  |
| 1.097000000000099 | 1.12 | 3.857 |  |
| 1.096500000000099 | 1.12 | 3.863 |  |
| 1.0960000000001 | 1.121 | 3.869 |  |
| 1.0955000000001 | 1.121 | 3.875 |  |
| 1.0950000000001 | 1.122 | 3.881 |  |
| 1.0945000000001 | 1.122 | 3.887 |  |
| 1.0940000000001 | 1.123 | 3.893 |  |
| 1.0935000000001 | 1.123 | 3.899 |  |
| 1.0930000000001 | 1.124 | 3.905 |  |
| 1.0925000000001 | 1.124 | 3.911 |  |
| 1.0920000000001 | 1.125 | 3.917 |  |
| 1.0915000000001 | 1.125 | 3.924 |  |
| 1.0910000000001 | 1.126 | 3.93 |  |
| 1.0905000000001 | 1.126 | 3.936 |  |
| 1.0900000000001 | 1.127 | 3.942 |  |
| 1.0895000000001 | 1.127 | 3.949 |  |
| 1.0890000000001 | 1.128 | 3.955 |  |
| 1.0885000000001 | 1.129 | 3.961 |  |
| 1.0880000000001 | 1.129 | 3.968 |  |
| 1.0875000000001 | 1.13 | 3.974 |  |
| 1.087000000000101 | 1.13 | 3.981 |  |
| 1.086500000000101 | 1.131 | 3.987 |  |
| 1.086000000000101 | 1.131 | 3.994 |  |
| 1.085500000000101 | 1.132 | 4.001 |  |
| 1.085000000000101 | 1.132 | 4.007 |  |
| 1.084500000000101 | 1.133 | 4.014 |  |
| 1.084000000000101 | 1.133 | 4.021 |  |
| 1.083500000000101 | 1.134 | 4.027 |  |
| 1.083000000000101 | 1.134 | 4.034 |  |
| 1.082500000000101 | 1.135 | 4.041 |  |
| 1.082000000000101 | 1.135 | 4.048 |  |
| 1.081500000000101 | 1.136 | 4.055 |  |
| 1.081000000000101 | 1.136 | 4.062 |  |
| 1.080500000000101 | 1.137 | 4.068 |  |
| 1.080000000000101 | 1.137 | 4.075 |  |
| 1.079500000000101 | 1.138 | 4.082 |  |
| 1.079000000000101 | 1.138 | 4.09 |  |
| 1.078500000000101 | 1.139 | 4.097 |  |
| 1.078000000000102 | 1.139 | 4.104 |  |
| 1.077500000000102 | 1.14 | 4.111 |  |
| 1.077000000000102 | 1.14 | 4.118 |  |
| 1.076500000000102 | 1.141 | 4.126 |  |
| 1.076000000000102 | 1.142 | 4.133 |  |
| 1.075500000000102 | 1.142 | 4.14 |  |
| 1.075000000000102 | 1.143 | 4.148 |  |
| 1.074500000000102 | 1.143 | 4.155 |  |
| 1.074000000000102 | 1.144 | 4.163 |  |
| 1.073500000000102 | 1.144 | 4.17 |  |
| 1.073000000000102 | 1.145 | 4.178 |  |
| 1.072500000000102 | 1.145 | 4.185 |  |
| 1.072000000000102 | 1.146 | 4.193 |  |
| 1.071500000000102 | 1.146 | 4.201 |  |
| 1.071000000000102 | 1.147 | 4.209 |  |
| 1.070500000000102 | 1.147 | 4.216 |  |
| 1.070000000000102 | 1.148 | 4.224 |  |
| 1.069500000000102 | 1.148 | 4.232 |  |
| 1.069000000000103 | 1.149 | 4.24 |  |
| 1.068500000000103 | 1.149 | 4.248 |  |
| 1.068000000000103 | 1.15 | 4.256 |  |
| 1.067500000000103 | 1.15 | 4.264 |  |
| 1.067000000000103 | 1.151 | 4.273 |  |
| 1.066500000000103 | 1.151 | 4.281 |  |
| 1.066000000000103 | 1.152 | 4.289 |  |
| 1.065500000000103 | 1.152 | 4.298 |  |
| 1.065000000000103 | 1.153 | 4.306 |  |
| 1.064500000000103 | 1.153 | 4.314 |  |
| 1.064000000000103 | 1.154 | 4.323 |  |
| 1.063500000000103 | 1.154 | 4.332 |  |
| 1.063000000000103 | 1.155 | 4.34 |  |
| 1.062500000000103 | 1.155 | 4.349 |  |
| 1.062000000000103 | 1.156 | 4.358 |  |
| 1.061500000000103 | 1.157 | 4.367 |  |
| 1.061000000000103 | 1.157 | 4.376 |  |
| 1.060500000000103 | 1.158 | 4.385 |  |
| 1.060000000000104 | 1.158 | 4.394 |  |
| 1.059500000000104 | 1.159 | 4.403 |  |
| 1.059000000000104 | 1.159 | 4.412 |  |
| 1.058500000000104 | 1.16 | 4.421 |  |
| 1.058000000000104 | 1.16 | 4.431 |  |
| 1.057500000000104 | 1.161 | 4.44 |  |
| 1.057000000000104 | 1.161 | 4.45 |  |
| 1.056500000000104 | 1.162 | 4.459 |  |
| 1.056000000000104 | 1.162 | 4.469 |  |
| 1.055500000000104 | 1.163 | 4.478 |  |
| 1.055000000000104 | 1.163 | 4.488 |  |
| 1.054500000000104 | 1.164 | 4.498 |  |
| 1.054000000000104 | 1.164 | 4.508 |  |
| 1.053500000000104 | 1.165 | 4.518 |  |
| 1.053000000000104 | 1.165 | 4.528 |  |
| 1.052500000000104 | 1.166 | 4.539 |  |
| 1.052000000000104 | 1.166 | 4.549 |  |
| 1.051500000000104 | 1.167 | 4.559 |  |
| 1.051000000000105 | 1.167 | 4.57 |  |
| 1.050500000000105 | 1.168 | 4.58 |  |
| 1.050000000000105 | 1.168 | 4.591 |  |
| 1.049500000000105 | 1.169 | 4.602 |  |
| 1.049000000000105 | 1.169 | 4.613 |  |
| 1.048500000000105 | 1.17 | 4.624 |  |
| 1.048000000000105 | 1.17 | 4.635 |  |
| 1.047500000000105 | 1.171 | 4.646 |  |
| 1.047000000000105 | 1.171 | 4.658 |  |
| 1.046500000000105 | 1.172 | 4.669 |  |
| 1.046000000000105 | 1.172 | 4.681 |  |
| 1.045500000000105 | 1.173 | 4.692 |  |
| 1.045000000000105 | 1.173 | 4.704 |  |
| 1.044500000000105 | 1.174 | 4.716 |  |
| 1.044000000000105 | 1.174 | 4.728 |  |
| 1.043500000000105 | 1.175 | 4.74 |  |
| 1.043000000000105 | 1.175 | 4.753 |  |
| 1.042500000000105 | 1.176 | 4.765 |  |
| 1.042000000000106 | 1.177 | 4.778 |  |
| 1.041500000000106 | 1.177 | 4.79 |  |
| 1.041000000000106 | 1.178 | 4.803 |  |
| 1.040500000000106 | 1.178 | 4.816 |  |
| 1.040000000000106 | 1.179 | 4.83 |  |
| 1.039500000000106 | 1.179 | 4.843 |  |
| 1.039000000000106 | 1.18 | 4.856 |  |
| 1.038500000000106 | 1.18 | 4.87 |  |
| 1.038000000000106 | 1.181 | 4.884 |  |
| 1.037500000000106 | 1.181 | 4.898 |  |
| 1.037000000000106 | 1.182 | 4.912 |  |
| 1.036500000000106 | 1.182 | 4.926 |  |
| 1.036000000000106 | 1.183 | 4.941 |  |
| 1.035500000000106 | 1.183 | 4.956 |  |
| 1.035000000000106 | 1.184 | 4.971 |  |
| 1.034500000000106 | 1.184 | 4.986 |  |
| 1.034000000000106 | 1.185 | 5.001 |  |
| 1.033500000000106 | 1.185 | 5.017 |  |
| 1.033000000000106 | 1.186 | 5.032 |  |
| 1.032500000000107 | 1.186 | 5.048 |  |
| 1.032000000000107 | 1.187 | 5.065 |  |
| 1.031500000000107 | 1.187 | 5.081 |  |
| 1.031000000000107 | 1.188 | 5.098 |  |
| 1.030500000000107 | 1.188 | 5.115 |  |
| 1.030000000000107 | 1.189 | 5.132 |  |
| 1.029500000000107 | 1.189 | 5.15 |  |
| 1.029000000000107 | 1.19 | 5.168 |  |
| 1.028500000000107 | 1.19 | 5.186 |  |
| 1.028000000000107 | 1.191 | 5.204 |  |
| 1.027500000000107 | 1.191 | 5.223 |  |
| 1.027000000000107 | 1.192 | 5.242 |  |
| 1.026500000000107 | 1.192 | 5.262 |  |
| 1.026000000000107 | 1.193 | 5.281 |  |
| 1.025500000000107 | 1.193 | 5.302 |  |
| 1.025000000000107 | 1.194 | 5.322 |  |
| 1.024500000000107 | 1.194 | 5.343 |  |
| 1.024000000000107 | 1.195 | 5.365 |  |
| 1.023500000000108 | 1.195 | 5.386 |  |
| 1.023000000000108 | 1.196 | 5.409 |  |
| 1.022500000000108 | 1.196 | 5.431 |  |
| 1.022000000000108 | 1.197 | 5.455 |  |
| 1.021500000000108 | 1.197 | 5.478 |  |
| 1.021000000000108 | 1.198 | 5.503 |  |
| 1.020500000000108 | 1.198 | 5.527 |  |
| 1.020000000000108 | 1.199 | 5.553 |  |
| 1.019500000000108 | 1.199 | 5.579 |  |
| 1.019000000000108 | 1.2 | 5.606 |  |
| 1.018500000000108 | 1.2 | 5.633 |  |
| 1.018000000000108 | 1.201 | 5.661 |  |
| 1.017500000000108 | 1.201 | 5.69 |  |
| 1.017000000000108 | 1.202 | 5.72 |  |
| 1.016500000000108 | 1.202 | 5.751 |  |
| 1.016000000000108 | 1.203 | 5.782 |  |
| 1.015500000000108 | 1.203 | 5.815 |  |
| 1.015000000000108 | 1.204 | 5.848 |  |
| 1.014500000000109 | 1.204 | 5.883 |  |
| 1.014000000000109 | 1.205 | 5.919 |  |
| 1.013500000000109 | 1.205 | 5.956 |  |
| 1.013000000000109 | 1.206 | 5.994 |  |
| 1.012500000000109 | 1.206 | 6.034 |  |
| 1.012000000000109 | 1.207 | 6.076 |  |
| 1.011500000000109 | 1.207 | 6.119 |  |
| 1.011000000000109 | 1.208 | 6.164 |  |
| 1.010500000000109 | 1.208 | 6.212 |  |
| 1.01000000000011 | 1.209 | 6.261 |  |
| 1.009500000000109 | 1.209 | 6.313 |  |
| 1.009000000000109 | 1.21 | 6.368 |  |
| 1.008500000000109 | 1.21 | 6.426 |  |
| 1.008000000000109 | 1.211 | 6.487 |  |
| 1.007500000000109 | 1.211 | 6.553 |  |
| 1.007000000000109 | 1.212 | 6.622 |  |
| 1.006500000000109 | 1.212 | 6.697 |  |
| 1.006000000000109 | 1.213 | 6.778 |  |
| 1.00550000000011 | 1.213 | 6.866 |  |
| 1.00500000000011 | 1.214 | 6.962 |  |
| 1.00450000000011 | 1.214 | 7.068 |  |
| 1.00400000000011 | 1.215 | 7.186 |  |
| 1.00350000000011 | 1.215 | 7.321 |  |
| 1.00300000000011 | 1.216 | 7.476 |  |
| 1.00250000000011 | 1.216 | 7.659 |  |
| 1.00200000000011 | 1.217 | 7.883 |  |
| 1.00150000000011 | 1.217 | 8.171 |  |
| 1.00100000000011 | 1.218 | 8.577 |  |
| 1.00050000000011 | 1.218 | 9.271 |  |
| 1.00000000000011 | 1.219 | 31.508 |  |